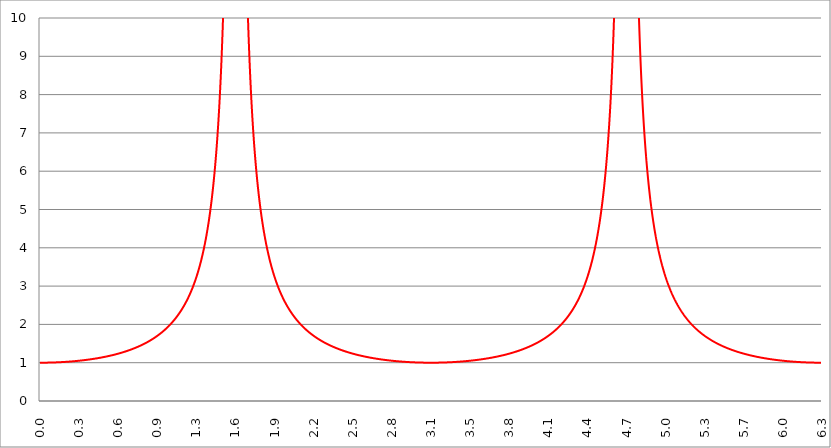
| Category | Series 1 | Series 0 | Series 2 |
|---|---|---|---|
| 0.0 | 1 |  |  |
| 0.00314159265358979 | 1 |  |  |
| 0.00628318530717958 | 1 |  |  |
| 0.00942477796076938 | 1 |  |  |
| 0.0125663706143592 | 1 |  |  |
| 0.015707963267949 | 1 |  |  |
| 0.0188495559215388 | 1 |  |  |
| 0.0219911485751285 | 1 |  |  |
| 0.0251327412287183 | 1 |  |  |
| 0.0282743338823081 | 1 |  |  |
| 0.0314159265358979 | 1 |  |  |
| 0.0345575191894877 | 1.001 |  |  |
| 0.0376991118430775 | 1.001 |  |  |
| 0.0408407044966673 | 1.001 |  |  |
| 0.0439822971502571 | 1.001 |  |  |
| 0.0471238898038469 | 1.001 |  |  |
| 0.0502654824574367 | 1.001 |  |  |
| 0.0534070751110265 | 1.001 |  |  |
| 0.0565486677646163 | 1.002 |  |  |
| 0.059690260418206 | 1.002 |  |  |
| 0.0628318530717958 | 1.002 |  |  |
| 0.0659734457253856 | 1.002 |  |  |
| 0.0691150383789754 | 1.002 |  |  |
| 0.0722566310325652 | 1.003 |  |  |
| 0.075398223686155 | 1.003 |  |  |
| 0.0785398163397448 | 1.003 |  |  |
| 0.0816814089933346 | 1.003 |  |  |
| 0.0848230016469244 | 1.004 |  |  |
| 0.0879645943005142 | 1.004 |  |  |
| 0.091106186954104 | 1.004 |  |  |
| 0.0942477796076937 | 1.004 |  |  |
| 0.0973893722612835 | 1.005 |  |  |
| 0.100530964914873 | 1.005 |  |  |
| 0.103672557568463 | 1.005 |  |  |
| 0.106814150222053 | 1.006 |  |  |
| 0.109955742875643 | 1.006 |  |  |
| 0.113097335529233 | 1.006 |  |  |
| 0.116238928182822 | 1.007 |  |  |
| 0.119380520836412 | 1.007 |  |  |
| 0.122522113490002 | 1.008 |  |  |
| 0.125663706143592 | 1.008 |  |  |
| 0.128805298797181 | 1.008 |  |  |
| 0.131946891450771 | 1.009 |  |  |
| 0.135088484104361 | 1.009 |  |  |
| 0.138230076757951 | 1.01 |  |  |
| 0.141371669411541 | 1.01 |  |  |
| 0.14451326206513 | 1.011 |  |  |
| 0.14765485471872 | 1.011 |  |  |
| 0.15079644737231 | 1.011 |  |  |
| 0.1539380400259 | 1.012 |  |  |
| 0.15707963267949 | 1.012 |  |  |
| 0.160221225333079 | 1.013 |  |  |
| 0.163362817986669 | 1.013 |  |  |
| 0.166504410640259 | 1.014 |  |  |
| 0.169646003293849 | 1.015 |  |  |
| 0.172787595947439 | 1.015 |  |  |
| 0.175929188601028 | 1.016 |  |  |
| 0.179070781254618 | 1.016 |  |  |
| 0.182212373908208 | 1.017 |  |  |
| 0.185353966561798 | 1.017 |  |  |
| 0.188495559215388 | 1.018 |  |  |
| 0.191637151868977 | 1.019 |  |  |
| 0.194778744522567 | 1.019 |  |  |
| 0.197920337176157 | 1.02 |  |  |
| 0.201061929829747 | 1.021 |  |  |
| 0.204203522483336 | 1.021 |  |  |
| 0.207345115136926 | 1.022 |  |  |
| 0.210486707790516 | 1.023 |  |  |
| 0.213628300444106 | 1.023 |  |  |
| 0.216769893097696 | 1.024 |  |  |
| 0.219911485751285 | 1.025 |  |  |
| 0.223053078404875 | 1.025 |  |  |
| 0.226194671058465 | 1.026 |  |  |
| 0.229336263712055 | 1.027 |  |  |
| 0.232477856365645 | 1.028 |  |  |
| 0.235619449019234 | 1.028 |  |  |
| 0.238761041672824 | 1.029 |  |  |
| 0.241902634326414 | 1.03 |  |  |
| 0.245044226980004 | 1.031 |  |  |
| 0.248185819633594 | 1.032 |  |  |
| 0.251327412287183 | 1.032 |  |  |
| 0.254469004940773 | 1.033 |  |  |
| 0.257610597594363 | 1.034 |  |  |
| 0.260752190247953 | 1.035 |  |  |
| 0.263893782901543 | 1.036 |  |  |
| 0.267035375555132 | 1.037 |  |  |
| 0.270176968208722 | 1.038 |  |  |
| 0.273318560862312 | 1.039 |  |  |
| 0.276460153515902 | 1.039 |  |  |
| 0.279601746169492 | 1.04 |  |  |
| 0.282743338823082 | 1.041 |  |  |
| 0.285884931476671 | 1.042 |  |  |
| 0.289026524130261 | 1.043 |  |  |
| 0.292168116783851 | 1.044 |  |  |
| 0.295309709437441 | 1.045 |  |  |
| 0.298451302091031 | 1.046 |  |  |
| 0.30159289474462 | 1.047 |  |  |
| 0.30473448739821 | 1.048 |  |  |
| 0.3078760800518 | 1.049 |  |  |
| 0.31101767270539 | 1.05 |  |  |
| 0.31415926535898 | 1.051 |  |  |
| 0.31730085801257 | 1.053 |  |  |
| 0.320442450666159 | 1.054 |  |  |
| 0.323584043319749 | 1.055 |  |  |
| 0.326725635973339 | 1.056 |  |  |
| 0.329867228626929 | 1.057 |  |  |
| 0.333008821280519 | 1.058 |  |  |
| 0.336150413934108 | 1.059 |  |  |
| 0.339292006587698 | 1.06 |  |  |
| 0.342433599241288 | 1.062 |  |  |
| 0.345575191894878 | 1.063 |  |  |
| 0.348716784548468 | 1.064 |  |  |
| 0.351858377202058 | 1.065 |  |  |
| 0.354999969855647 | 1.067 |  |  |
| 0.358141562509237 | 1.068 |  |  |
| 0.361283155162827 | 1.069 |  |  |
| 0.364424747816417 | 1.07 |  |  |
| 0.367566340470007 | 1.072 |  |  |
| 0.370707933123597 | 1.073 |  |  |
| 0.373849525777186 | 1.074 |  |  |
| 0.376991118430776 | 1.076 |  |  |
| 0.380132711084366 | 1.077 |  |  |
| 0.383274303737956 | 1.078 |  |  |
| 0.386415896391546 | 1.08 |  |  |
| 0.389557489045135 | 1.081 |  |  |
| 0.392699081698725 | 1.082 |  |  |
| 0.395840674352315 | 1.084 |  |  |
| 0.398982267005905 | 1.085 |  |  |
| 0.402123859659495 | 1.087 |  |  |
| 0.405265452313085 | 1.088 |  |  |
| 0.408407044966674 | 1.09 |  |  |
| 0.411548637620264 | 1.091 |  |  |
| 0.414690230273854 | 1.093 |  |  |
| 0.417831822927444 | 1.094 |  |  |
| 0.420973415581034 | 1.096 |  |  |
| 0.424115008234623 | 1.097 |  |  |
| 0.427256600888213 | 1.099 |  |  |
| 0.430398193541803 | 1.1 |  |  |
| 0.433539786195393 | 1.102 |  |  |
| 0.436681378848983 | 1.104 |  |  |
| 0.439822971502573 | 1.105 |  |  |
| 0.442964564156162 | 1.107 |  |  |
| 0.446106156809752 | 1.108 |  |  |
| 0.449247749463342 | 1.11 |  |  |
| 0.452389342116932 | 1.112 |  |  |
| 0.455530934770522 | 1.114 |  |  |
| 0.458672527424111 | 1.115 |  |  |
| 0.461814120077701 | 1.117 |  |  |
| 0.464955712731291 | 1.119 |  |  |
| 0.468097305384881 | 1.121 |  |  |
| 0.471238898038471 | 1.122 |  |  |
| 0.474380490692061 | 1.124 |  |  |
| 0.47752208334565 | 1.126 |  |  |
| 0.48066367599924 | 1.128 |  |  |
| 0.48380526865283 | 1.13 |  |  |
| 0.48694686130642 | 1.132 |  |  |
| 0.49008845396001 | 1.133 |  |  |
| 0.493230046613599 | 1.135 |  |  |
| 0.496371639267189 | 1.137 |  |  |
| 0.499513231920779 | 1.139 |  |  |
| 0.502654824574369 | 1.141 |  |  |
| 0.505796417227959 | 1.143 |  |  |
| 0.508938009881549 | 1.145 |  |  |
| 0.512079602535138 | 1.147 |  |  |
| 0.515221195188728 | 1.149 |  |  |
| 0.518362787842318 | 1.151 |  |  |
| 0.521504380495908 | 1.153 |  |  |
| 0.524645973149498 | 1.155 |  |  |
| 0.527787565803087 | 1.158 |  |  |
| 0.530929158456677 | 1.16 |  |  |
| 0.534070751110267 | 1.162 |  |  |
| 0.537212343763857 | 1.164 |  |  |
| 0.540353936417447 | 1.166 |  |  |
| 0.543495529071037 | 1.168 |  |  |
| 0.546637121724626 | 1.171 |  |  |
| 0.549778714378216 | 1.173 |  |  |
| 0.552920307031806 | 1.175 |  |  |
| 0.556061899685396 | 1.177 |  |  |
| 0.559203492338986 | 1.18 |  |  |
| 0.562345084992576 | 1.182 |  |  |
| 0.565486677646165 | 1.184 |  |  |
| 0.568628270299755 | 1.187 |  |  |
| 0.571769862953345 | 1.189 |  |  |
| 0.574911455606935 | 1.192 |  |  |
| 0.578053048260525 | 1.194 |  |  |
| 0.581194640914114 | 1.196 |  |  |
| 0.584336233567704 | 1.199 |  |  |
| 0.587477826221294 | 1.201 |  |  |
| 0.590619418874884 | 1.204 |  |  |
| 0.593761011528474 | 1.207 |  |  |
| 0.596902604182064 | 1.209 |  |  |
| 0.600044196835653 | 1.212 |  |  |
| 0.603185789489243 | 1.214 |  |  |
| 0.606327382142833 | 1.217 |  |  |
| 0.609468974796423 | 1.22 |  |  |
| 0.612610567450013 | 1.222 |  |  |
| 0.615752160103602 | 1.225 |  |  |
| 0.618893752757192 | 1.228 |  |  |
| 0.622035345410782 | 1.23 |  |  |
| 0.625176938064372 | 1.233 |  |  |
| 0.628318530717962 | 1.236 |  |  |
| 0.631460123371551 | 1.239 |  |  |
| 0.634601716025141 | 1.242 |  |  |
| 0.637743308678731 | 1.245 |  |  |
| 0.640884901332321 | 1.248 |  |  |
| 0.644026493985911 | 1.25 |  |  |
| 0.647168086639501 | 1.253 |  |  |
| 0.65030967929309 | 1.256 |  |  |
| 0.65345127194668 | 1.259 |  |  |
| 0.65659286460027 | 1.263 |  |  |
| 0.65973445725386 | 1.266 |  |  |
| 0.66287604990745 | 1.269 |  |  |
| 0.666017642561039 | 1.272 |  |  |
| 0.669159235214629 | 1.275 |  |  |
| 0.672300827868219 | 1.278 |  |  |
| 0.675442420521809 | 1.281 |  |  |
| 0.678584013175399 | 1.285 |  |  |
| 0.681725605828989 | 1.288 |  |  |
| 0.684867198482578 | 1.291 |  |  |
| 0.688008791136168 | 1.294 |  |  |
| 0.691150383789758 | 1.298 |  |  |
| 0.694291976443348 | 1.301 |  |  |
| 0.697433569096938 | 1.305 |  |  |
| 0.700575161750528 | 1.308 |  |  |
| 0.703716754404117 | 1.312 |  |  |
| 0.706858347057707 | 1.315 |  |  |
| 0.709999939711297 | 1.319 |  |  |
| 0.713141532364887 | 1.322 |  |  |
| 0.716283125018477 | 1.326 |  |  |
| 0.719424717672066 | 1.329 |  |  |
| 0.722566310325656 | 1.333 |  |  |
| 0.725707902979246 | 1.337 |  |  |
| 0.728849495632836 | 1.341 |  |  |
| 0.731991088286426 | 1.344 |  |  |
| 0.735132680940016 | 1.348 |  |  |
| 0.738274273593605 | 1.352 |  |  |
| 0.741415866247195 | 1.356 |  |  |
| 0.744557458900785 | 1.36 |  |  |
| 0.747699051554375 | 1.364 |  |  |
| 0.750840644207965 | 1.368 |  |  |
| 0.753982236861554 | 1.372 |  |  |
| 0.757123829515144 | 1.376 |  |  |
| 0.760265422168734 | 1.38 |  |  |
| 0.763407014822324 | 1.384 |  |  |
| 0.766548607475914 | 1.388 |  |  |
| 0.769690200129504 | 1.393 |  |  |
| 0.772831792783093 | 1.397 |  |  |
| 0.775973385436683 | 1.401 |  |  |
| 0.779114978090273 | 1.405 |  |  |
| 0.782256570743863 | 1.41 |  |  |
| 0.785398163397453 | 1.414 |  |  |
| 0.788539756051042 | 1.419 |  |  |
| 0.791681348704632 | 1.423 |  |  |
| 0.794822941358222 | 1.428 |  |  |
| 0.797964534011812 | 1.432 |  |  |
| 0.801106126665402 | 1.437 |  |  |
| 0.804247719318992 | 1.442 |  |  |
| 0.807389311972581 | 1.446 |  |  |
| 0.810530904626171 | 1.451 |  |  |
| 0.813672497279761 | 1.456 |  |  |
| 0.816814089933351 | 1.461 |  |  |
| 0.819955682586941 | 1.466 |  |  |
| 0.823097275240531 | 1.471 |  |  |
| 0.82623886789412 | 1.476 |  |  |
| 0.82938046054771 | 1.481 |  |  |
| 0.8325220532013 | 1.486 |  |  |
| 0.83566364585489 | 1.491 |  |  |
| 0.83880523850848 | 1.496 |  |  |
| 0.841946831162069 | 1.501 |  |  |
| 0.845088423815659 | 1.507 |  |  |
| 0.848230016469249 | 1.512 |  |  |
| 0.851371609122839 | 1.518 |  |  |
| 0.854513201776429 | 1.523 |  |  |
| 0.857654794430019 | 1.529 |  |  |
| 0.860796387083608 | 1.534 |  |  |
| 0.863937979737198 | 1.54 |  |  |
| 0.867079572390788 | 1.545 |  |  |
| 0.870221165044378 | 1.551 |  |  |
| 0.873362757697968 | 1.557 |  |  |
| 0.876504350351557 | 1.563 |  |  |
| 0.879645943005147 | 1.569 |  |  |
| 0.882787535658737 | 1.575 |  |  |
| 0.885929128312327 | 1.581 |  |  |
| 0.889070720965917 | 1.587 |  |  |
| 0.892212313619507 | 1.593 |  |  |
| 0.895353906273096 | 1.599 |  |  |
| 0.898495498926686 | 1.606 |  |  |
| 0.901637091580276 | 1.612 |  |  |
| 0.904778684233866 | 1.618 |  |  |
| 0.907920276887456 | 1.625 |  |  |
| 0.911061869541045 | 1.632 |  |  |
| 0.914203462194635 | 1.638 |  |  |
| 0.917345054848225 | 1.645 |  |  |
| 0.920486647501815 | 1.652 |  |  |
| 0.923628240155405 | 1.659 |  |  |
| 0.926769832808995 | 1.666 |  |  |
| 0.929911425462584 | 1.673 |  |  |
| 0.933053018116174 | 1.68 |  |  |
| 0.936194610769764 | 1.687 |  |  |
| 0.939336203423354 | 1.694 |  |  |
| 0.942477796076944 | 1.701 |  |  |
| 0.945619388730533 | 1.709 |  |  |
| 0.948760981384123 | 1.716 |  |  |
| 0.951902574037713 | 1.724 |  |  |
| 0.955044166691303 | 1.731 |  |  |
| 0.958185759344893 | 1.739 |  |  |
| 0.961327351998483 | 1.747 |  |  |
| 0.964468944652072 | 1.755 |  |  |
| 0.967610537305662 | 1.763 |  |  |
| 0.970752129959252 | 1.771 |  |  |
| 0.973893722612842 | 1.779 |  |  |
| 0.977035315266432 | 1.787 |  |  |
| 0.980176907920022 | 1.796 |  |  |
| 0.983318500573611 | 1.804 |  |  |
| 0.986460093227201 | 1.813 |  |  |
| 0.989601685880791 | 1.821 |  |  |
| 0.992743278534381 | 1.83 |  |  |
| 0.995884871187971 | 1.839 |  |  |
| 0.99902646384156 | 1.848 |  |  |
| 1.00216805649515 | 1.857 |  |  |
| 1.00530964914874 | 1.866 |  |  |
| 1.00845124180233 | 1.876 |  |  |
| 1.01159283445592 | 1.885 |  |  |
| 1.01473442710951 | 1.894 |  |  |
| 1.017876019763099 | 1.904 |  |  |
| 1.021017612416689 | 1.914 |  |  |
| 1.02415920507028 | 1.924 |  |  |
| 1.027300797723869 | 1.934 |  |  |
| 1.030442390377459 | 1.944 |  |  |
| 1.033583983031048 | 1.954 |  |  |
| 1.036725575684638 | 1.964 |  |  |
| 1.039867168338228 | 1.975 |  |  |
| 1.043008760991818 | 1.986 |  |  |
| 1.046150353645408 | 1.996 |  |  |
| 1.049291946298998 | 2.007 |  |  |
| 1.052433538952587 | 2.018 |  |  |
| 1.055575131606177 | 2.03 |  |  |
| 1.058716724259767 | 2.041 |  |  |
| 1.061858316913357 | 2.052 |  |  |
| 1.064999909566947 | 2.064 |  |  |
| 1.068141502220536 | 2.076 |  |  |
| 1.071283094874126 | 2.088 |  |  |
| 1.074424687527716 | 2.1 |  |  |
| 1.077566280181306 | 2.112 |  |  |
| 1.080707872834896 | 2.124 |  |  |
| 1.083849465488486 | 2.137 |  |  |
| 1.086991058142075 | 2.15 |  |  |
| 1.090132650795665 | 2.163 |  |  |
| 1.093274243449255 | 2.176 |  |  |
| 1.096415836102845 | 2.189 |  |  |
| 1.099557428756435 | 2.203 |  |  |
| 1.102699021410025 | 2.216 |  |  |
| 1.105840614063614 | 2.23 |  |  |
| 1.108982206717204 | 2.244 |  |  |
| 1.112123799370794 | 2.259 |  |  |
| 1.115265392024384 | 2.273 |  |  |
| 1.118406984677974 | 2.288 |  |  |
| 1.121548577331563 | 2.303 |  |  |
| 1.124690169985153 | 2.318 |  |  |
| 1.127831762638743 | 2.333 |  |  |
| 1.130973355292333 | 2.349 |  |  |
| 1.134114947945923 | 2.364 |  |  |
| 1.137256540599513 | 2.38 |  |  |
| 1.140398133253102 | 2.397 |  |  |
| 1.143539725906692 | 2.413 |  |  |
| 1.146681318560282 | 2.43 |  |  |
| 1.149822911213872 | 2.447 |  |  |
| 1.152964503867462 | 2.464 |  |  |
| 1.156106096521051 | 2.482 |  |  |
| 1.159247689174641 | 2.5 |  |  |
| 1.162389281828231 | 2.518 |  |  |
| 1.165530874481821 | 2.536 |  |  |
| 1.168672467135411 | 2.555 |  |  |
| 1.171814059789001 | 2.574 |  |  |
| 1.17495565244259 | 2.593 |  |  |
| 1.17809724509618 | 2.613 |  |  |
| 1.18123883774977 | 2.633 |  |  |
| 1.18438043040336 | 2.653 |  |  |
| 1.18752202305695 | 2.674 |  |  |
| 1.190663615710539 | 2.695 |  |  |
| 1.193805208364129 | 2.716 |  |  |
| 1.19694680101772 | 2.738 |  |  |
| 1.200088393671309 | 2.76 |  |  |
| 1.203229986324899 | 2.783 |  |  |
| 1.206371578978489 | 2.806 |  |  |
| 1.209513171632078 | 2.829 |  |  |
| 1.212654764285668 | 2.853 |  |  |
| 1.215796356939258 | 2.877 |  |  |
| 1.218937949592848 | 2.902 |  |  |
| 1.222079542246438 | 2.927 |  |  |
| 1.225221134900027 | 2.952 |  |  |
| 1.228362727553617 | 2.978 |  |  |
| 1.231504320207207 | 3.005 |  |  |
| 1.234645912860797 | 3.032 |  |  |
| 1.237787505514387 | 3.059 |  |  |
| 1.240929098167977 | 3.087 |  |  |
| 1.244070690821566 | 3.116 |  |  |
| 1.247212283475156 | 3.145 |  |  |
| 1.250353876128746 | 3.175 |  |  |
| 1.253495468782336 | 3.205 |  |  |
| 1.256637061435926 | 3.236 |  |  |
| 1.259778654089515 | 3.268 |  |  |
| 1.262920246743105 | 3.3 |  |  |
| 1.266061839396695 | 3.333 |  |  |
| 1.269203432050285 | 3.367 |  |  |
| 1.272345024703875 | 3.401 |  |  |
| 1.275486617357465 | 3.436 |  |  |
| 1.278628210011054 | 3.472 |  |  |
| 1.281769802664644 | 3.509 |  |  |
| 1.284911395318234 | 3.546 |  |  |
| 1.288052987971824 | 3.584 |  |  |
| 1.291194580625414 | 3.624 |  |  |
| 1.294336173279003 | 3.664 |  |  |
| 1.297477765932593 | 3.705 |  |  |
| 1.300619358586183 | 3.747 |  |  |
| 1.303760951239773 | 3.79 |  |  |
| 1.306902543893363 | 3.834 |  |  |
| 1.310044136546953 | 3.879 |  |  |
| 1.313185729200542 | 3.925 |  |  |
| 1.316327321854132 | 3.972 |  |  |
| 1.319468914507722 | 4.021 |  |  |
| 1.322610507161312 | 4.071 |  |  |
| 1.325752099814902 | 4.122 |  |  |
| 1.328893692468491 | 4.174 |  |  |
| 1.332035285122081 | 4.228 |  |  |
| 1.335176877775671 | 4.284 |  |  |
| 1.338318470429261 | 4.34 |  |  |
| 1.341460063082851 | 4.399 |  |  |
| 1.344601655736441 | 4.459 |  |  |
| 1.34774324839003 | 4.521 |  |  |
| 1.35088484104362 | 4.584 |  |  |
| 1.35402643369721 | 4.65 |  |  |
| 1.3571680263508 | 4.717 |  |  |
| 1.36030961900439 | 4.786 |  |  |
| 1.363451211657979 | 4.858 |  |  |
| 1.36659280431157 | 4.931 |  |  |
| 1.369734396965159 | 5.007 |  |  |
| 1.372875989618749 | 5.086 |  |  |
| 1.376017582272339 | 5.167 |  |  |
| 1.379159174925929 | 5.25 |  |  |
| 1.382300767579518 | 5.337 |  |  |
| 1.385442360233108 | 5.426 |  |  |
| 1.388583952886698 | 5.519 |  |  |
| 1.391725545540288 | 5.614 |  |  |
| 1.394867138193878 | 5.714 |  |  |
| 1.398008730847468 | 5.816 |  |  |
| 1.401150323501057 | 5.923 |  |  |
| 1.404291916154647 | 6.034 |  |  |
| 1.407433508808237 | 6.149 |  |  |
| 1.410575101461827 | 6.268 |  |  |
| 1.413716694115417 | 6.392 |  |  |
| 1.416858286769006 | 6.522 |  |  |
| 1.419999879422596 | 6.657 |  |  |
| 1.423141472076186 | 6.797 |  |  |
| 1.426283064729776 | 6.944 |  |  |
| 1.429424657383366 | 7.097 |  |  |
| 1.432566250036956 | 7.257 |  |  |
| 1.435707842690545 | 7.425 |  |  |
| 1.438849435344135 | 7.601 |  |  |
| 1.441991027997725 | 7.785 |  |  |
| 1.445132620651315 | 7.979 |  |  |
| 1.448274213304905 | 8.182 |  |  |
| 1.451415805958494 | 8.397 |  |  |
| 1.454557398612084 | 8.622 |  |  |
| 1.457698991265674 | 8.861 |  |  |
| 1.460840583919264 | 9.113 |  |  |
| 1.463982176572854 | 9.38 |  |  |
| 1.467123769226444 | 9.663 |  |  |
| 1.470265361880033 | 9.964 |  |  |
| 1.473406954533623 | 10.284 |  |  |
| 1.476548547187213 | 10.626 |  |  |
| 1.479690139840803 | 10.991 |  |  |
| 1.482831732494393 | 11.383 |  |  |
| 1.485973325147982 | 11.803 |  |  |
| 1.489114917801572 | 12.256 |  |  |
| 1.492256510455162 | 12.745 |  |  |
| 1.495398103108752 | 13.275 |  |  |
| 1.498539695762342 | 13.852 |  |  |
| 1.501681288415932 | 14.48 |  |  |
| 1.504822881069521 | 15.169 |  |  |
| 1.507964473723111 | 15.926 |  |  |
| 1.511106066376701 | 16.763 |  |  |
| 1.514247659030291 | 17.693 |  |  |
| 1.517389251683881 | 18.733 |  |  |
| 1.520530844337471 | 19.903 |  |  |
| 1.52367243699106 | 21.229 |  |  |
| 1.52681402964465 | 22.744 |  |  |
| 1.52995562229824 | 24.492 |  |  |
| 1.53309721495183 | 26.532 |  |  |
| 1.53623880760542 | 28.943 |  |  |
| 1.539380400259009 | 31.836 |  |  |
| 1.542521992912599 | 35.372 |  |  |
| 1.545663585566189 | 39.793 |  |  |
| 1.548805178219779 | 45.477 |  |  |
| 1.551946770873369 | 53.055 |  |  |
| 1.555088363526959 | 63.665 |  |  |
| 1.558229956180548 | 79.58 |  |  |
| 1.561371548834138 | 106.105 |  |  |
| 1.564513141487728 | 159.156 |  |  |
| 1.567654734141318 | 318.31 |  |  |
| 1.570796326794908 | 90571729138849.9 |  |  |
| 1.573937919448497 | 318.31 |  |  |
| 1.577079512102087 | 159.156 |  |  |
| 1.580221104755677 | 106.105 |  |  |
| 1.583362697409267 | 79.58 |  |  |
| 1.586504290062857 | 63.665 |  |  |
| 1.589645882716447 | 53.055 |  |  |
| 1.592787475370036 | 45.477 |  |  |
| 1.595929068023626 | 39.793 |  |  |
| 1.599070660677216 | 35.372 |  |  |
| 1.602212253330806 | 31.836 |  |  |
| 1.605353845984396 | 28.943 |  |  |
| 1.608495438637985 | 26.532 |  |  |
| 1.611637031291575 | 24.492 |  |  |
| 1.614778623945165 | 22.744 |  |  |
| 1.617920216598755 | 21.229 |  |  |
| 1.621061809252345 | 19.903 |  |  |
| 1.624203401905935 | 18.733 |  |  |
| 1.627344994559524 | 17.693 |  |  |
| 1.630486587213114 | 16.763 |  |  |
| 1.633628179866704 | 15.926 |  |  |
| 1.636769772520294 | 15.169 |  |  |
| 1.639911365173884 | 14.48 |  |  |
| 1.643052957827473 | 13.852 |  |  |
| 1.646194550481063 | 13.275 |  |  |
| 1.649336143134653 | 12.745 |  |  |
| 1.652477735788243 | 12.256 |  |  |
| 1.655619328441833 | 11.803 |  |  |
| 1.658760921095423 | 11.383 |  |  |
| 1.661902513749012 | 10.991 |  |  |
| 1.665044106402602 | 10.626 |  |  |
| 1.668185699056192 | 10.284 |  |  |
| 1.671327291709782 | 9.964 |  |  |
| 1.674468884363372 | 9.663 |  |  |
| 1.677610477016961 | 9.38 |  |  |
| 1.680752069670551 | 9.113 |  |  |
| 1.683893662324141 | 8.861 |  |  |
| 1.687035254977731 | 8.622 |  |  |
| 1.690176847631321 | 8.397 |  |  |
| 1.693318440284911 | 8.182 |  |  |
| 1.6964600329385 | 7.979 |  |  |
| 1.69960162559209 | 7.785 |  |  |
| 1.70274321824568 | 7.601 |  |  |
| 1.70588481089927 | 7.425 |  |  |
| 1.70902640355286 | 7.257 |  |  |
| 1.712167996206449 | 7.097 |  |  |
| 1.715309588860039 | 6.944 |  |  |
| 1.71845118151363 | 6.797 |  |  |
| 1.721592774167219 | 6.657 |  |  |
| 1.724734366820809 | 6.522 |  |  |
| 1.727875959474399 | 6.392 |  |  |
| 1.731017552127988 | 6.268 |  |  |
| 1.734159144781578 | 6.149 |  |  |
| 1.737300737435168 | 6.034 |  |  |
| 1.740442330088758 | 5.923 |  |  |
| 1.743583922742348 | 5.816 |  |  |
| 1.746725515395937 | 5.714 |  |  |
| 1.749867108049527 | 5.614 |  |  |
| 1.753008700703117 | 5.519 |  |  |
| 1.756150293356707 | 5.426 |  |  |
| 1.759291886010297 | 5.337 |  |  |
| 1.762433478663887 | 5.25 |  |  |
| 1.765575071317476 | 5.167 |  |  |
| 1.768716663971066 | 5.086 |  |  |
| 1.771858256624656 | 5.007 |  |  |
| 1.774999849278246 | 4.931 |  |  |
| 1.778141441931836 | 4.858 |  |  |
| 1.781283034585426 | 4.786 |  |  |
| 1.784424627239015 | 4.717 |  |  |
| 1.787566219892605 | 4.65 |  |  |
| 1.790707812546195 | 4.584 |  |  |
| 1.793849405199785 | 4.521 |  |  |
| 1.796990997853375 | 4.459 |  |  |
| 1.800132590506964 | 4.399 |  |  |
| 1.803274183160554 | 4.34 |  |  |
| 1.806415775814144 | 4.284 |  |  |
| 1.809557368467734 | 4.228 |  |  |
| 1.812698961121324 | 4.174 |  |  |
| 1.815840553774914 | 4.122 |  |  |
| 1.818982146428503 | 4.071 |  |  |
| 1.822123739082093 | 4.021 |  |  |
| 1.825265331735683 | 3.972 |  |  |
| 1.828406924389273 | 3.925 |  |  |
| 1.831548517042863 | 3.879 |  |  |
| 1.834690109696452 | 3.834 |  |  |
| 1.837831702350042 | 3.79 |  |  |
| 1.840973295003632 | 3.747 |  |  |
| 1.844114887657222 | 3.705 |  |  |
| 1.847256480310812 | 3.664 |  |  |
| 1.850398072964402 | 3.624 |  |  |
| 1.853539665617991 | 3.584 |  |  |
| 1.856681258271581 | 3.546 |  |  |
| 1.859822850925171 | 3.509 |  |  |
| 1.862964443578761 | 3.472 |  |  |
| 1.866106036232351 | 3.436 |  |  |
| 1.86924762888594 | 3.401 |  |  |
| 1.87238922153953 | 3.367 |  |  |
| 1.87553081419312 | 3.333 |  |  |
| 1.87867240684671 | 3.3 |  |  |
| 1.8818139995003 | 3.268 |  |  |
| 1.88495559215389 | 3.236 |  |  |
| 1.888097184807479 | 3.205 |  |  |
| 1.891238777461069 | 3.175 |  |  |
| 1.89438037011466 | 3.145 |  |  |
| 1.897521962768249 | 3.116 |  |  |
| 1.900663555421839 | 3.087 |  |  |
| 1.903805148075429 | 3.059 |  |  |
| 1.906946740729018 | 3.032 |  |  |
| 1.910088333382608 | 3.005 |  |  |
| 1.913229926036198 | 2.978 |  |  |
| 1.916371518689788 | 2.952 |  |  |
| 1.919513111343378 | 2.927 |  |  |
| 1.922654703996967 | 2.902 |  |  |
| 1.925796296650557 | 2.877 |  |  |
| 1.928937889304147 | 2.853 |  |  |
| 1.932079481957737 | 2.829 |  |  |
| 1.935221074611327 | 2.806 |  |  |
| 1.938362667264917 | 2.783 |  |  |
| 1.941504259918506 | 2.76 |  |  |
| 1.944645852572096 | 2.738 |  |  |
| 1.947787445225686 | 2.716 |  |  |
| 1.950929037879276 | 2.695 |  |  |
| 1.954070630532866 | 2.674 |  |  |
| 1.957212223186455 | 2.653 |  |  |
| 1.960353815840045 | 2.633 |  |  |
| 1.963495408493635 | 2.613 |  |  |
| 1.966637001147225 | 2.593 |  |  |
| 1.969778593800815 | 2.574 |  |  |
| 1.972920186454405 | 2.555 |  |  |
| 1.976061779107994 | 2.536 |  |  |
| 1.979203371761584 | 2.518 |  |  |
| 1.982344964415174 | 2.5 |  |  |
| 1.985486557068764 | 2.482 |  |  |
| 1.988628149722354 | 2.464 |  |  |
| 1.991769742375943 | 2.447 |  |  |
| 1.994911335029533 | 2.43 |  |  |
| 1.998052927683123 | 2.413 |  |  |
| 2.001194520336712 | 2.397 |  |  |
| 2.004336112990302 | 2.38 |  |  |
| 2.007477705643892 | 2.364 |  |  |
| 2.010619298297482 | 2.349 |  |  |
| 2.013760890951071 | 2.333 |  |  |
| 2.016902483604661 | 2.318 |  |  |
| 2.02004407625825 | 2.303 |  |  |
| 2.02318566891184 | 2.288 |  |  |
| 2.02632726156543 | 2.273 |  |  |
| 2.029468854219019 | 2.259 |  |  |
| 2.032610446872609 | 2.244 |  |  |
| 2.035752039526198 | 2.23 |  |  |
| 2.038893632179788 | 2.216 |  |  |
| 2.042035224833378 | 2.203 |  |  |
| 2.045176817486967 | 2.189 |  |  |
| 2.048318410140557 | 2.176 |  |  |
| 2.051460002794146 | 2.163 |  |  |
| 2.054601595447736 | 2.15 |  |  |
| 2.057743188101325 | 2.137 |  |  |
| 2.060884780754915 | 2.124 |  |  |
| 2.064026373408505 | 2.112 |  |  |
| 2.067167966062094 | 2.1 |  |  |
| 2.070309558715684 | 2.088 |  |  |
| 2.073451151369273 | 2.076 |  |  |
| 2.076592744022863 | 2.064 |  |  |
| 2.079734336676452 | 2.052 |  |  |
| 2.082875929330042 | 2.041 |  |  |
| 2.086017521983632 | 2.03 |  |  |
| 2.089159114637221 | 2.018 |  |  |
| 2.092300707290811 | 2.007 |  |  |
| 2.095442299944401 | 1.996 |  |  |
| 2.09858389259799 | 1.986 |  |  |
| 2.10172548525158 | 1.975 |  |  |
| 2.104867077905169 | 1.964 |  |  |
| 2.108008670558759 | 1.954 |  |  |
| 2.111150263212349 | 1.944 |  |  |
| 2.114291855865938 | 1.934 |  |  |
| 2.117433448519528 | 1.924 |  |  |
| 2.120575041173117 | 1.914 |  |  |
| 2.123716633826707 | 1.904 |  |  |
| 2.126858226480297 | 1.894 |  |  |
| 2.129999819133886 | 1.885 |  |  |
| 2.133141411787476 | 1.876 |  |  |
| 2.136283004441065 | 1.866 |  |  |
| 2.139424597094655 | 1.857 |  |  |
| 2.142566189748245 | 1.848 |  |  |
| 2.145707782401834 | 1.839 |  |  |
| 2.148849375055424 | 1.83 |  |  |
| 2.151990967709013 | 1.821 |  |  |
| 2.155132560362603 | 1.813 |  |  |
| 2.158274153016193 | 1.804 |  |  |
| 2.161415745669782 | 1.796 |  |  |
| 2.164557338323372 | 1.787 |  |  |
| 2.167698930976961 | 1.779 |  |  |
| 2.170840523630551 | 1.771 |  |  |
| 2.173982116284141 | 1.763 |  |  |
| 2.17712370893773 | 1.755 |  |  |
| 2.18026530159132 | 1.747 |  |  |
| 2.183406894244909 | 1.739 |  |  |
| 2.186548486898499 | 1.731 |  |  |
| 2.189690079552089 | 1.724 |  |  |
| 2.192831672205678 | 1.716 |  |  |
| 2.195973264859268 | 1.709 |  |  |
| 2.199114857512857 | 1.701 |  |  |
| 2.202256450166447 | 1.694 |  |  |
| 2.205398042820036 | 1.687 |  |  |
| 2.208539635473626 | 1.68 |  |  |
| 2.211681228127216 | 1.673 |  |  |
| 2.214822820780805 | 1.666 |  |  |
| 2.217964413434395 | 1.659 |  |  |
| 2.221106006087984 | 1.652 |  |  |
| 2.224247598741574 | 1.645 |  |  |
| 2.227389191395164 | 1.638 |  |  |
| 2.230530784048753 | 1.632 |  |  |
| 2.233672376702343 | 1.625 |  |  |
| 2.236813969355933 | 1.618 |  |  |
| 2.239955562009522 | 1.612 |  |  |
| 2.243097154663112 | 1.606 |  |  |
| 2.246238747316701 | 1.599 |  |  |
| 2.249380339970291 | 1.593 |  |  |
| 2.252521932623881 | 1.587 |  |  |
| 2.25566352527747 | 1.581 |  |  |
| 2.25880511793106 | 1.575 |  |  |
| 2.261946710584649 | 1.569 |  |  |
| 2.265088303238239 | 1.563 |  |  |
| 2.268229895891829 | 1.557 |  |  |
| 2.271371488545418 | 1.551 |  |  |
| 2.274513081199008 | 1.545 |  |  |
| 2.277654673852597 | 1.54 |  |  |
| 2.280796266506186 | 1.534 |  |  |
| 2.283937859159776 | 1.529 |  |  |
| 2.287079451813366 | 1.523 |  |  |
| 2.290221044466955 | 1.518 |  |  |
| 2.293362637120545 | 1.512 |  |  |
| 2.296504229774135 | 1.507 |  |  |
| 2.299645822427724 | 1.501 |  |  |
| 2.302787415081314 | 1.496 |  |  |
| 2.305929007734904 | 1.491 |  |  |
| 2.309070600388493 | 1.486 |  |  |
| 2.312212193042083 | 1.481 |  |  |
| 2.315353785695672 | 1.476 |  |  |
| 2.318495378349262 | 1.471 |  |  |
| 2.321636971002852 | 1.466 |  |  |
| 2.324778563656441 | 1.461 |  |  |
| 2.327920156310031 | 1.456 |  |  |
| 2.33106174896362 | 1.451 |  |  |
| 2.33420334161721 | 1.446 |  |  |
| 2.3373449342708 | 1.442 |  |  |
| 2.340486526924389 | 1.437 |  |  |
| 2.343628119577979 | 1.432 |  |  |
| 2.346769712231568 | 1.428 |  |  |
| 2.349911304885158 | 1.423 |  |  |
| 2.353052897538748 | 1.419 |  |  |
| 2.356194490192337 | 1.414 |  |  |
| 2.359336082845927 | 1.41 |  |  |
| 2.362477675499516 | 1.405 |  |  |
| 2.365619268153106 | 1.401 |  |  |
| 2.368760860806696 | 1.397 |  |  |
| 2.371902453460285 | 1.393 |  |  |
| 2.375044046113875 | 1.388 |  |  |
| 2.378185638767464 | 1.384 |  |  |
| 2.381327231421054 | 1.38 |  |  |
| 2.384468824074644 | 1.376 |  |  |
| 2.387610416728233 | 1.372 |  |  |
| 2.390752009381823 | 1.368 |  |  |
| 2.393893602035412 | 1.364 |  |  |
| 2.397035194689002 | 1.36 |  |  |
| 2.400176787342591 | 1.356 |  |  |
| 2.403318379996181 | 1.352 |  |  |
| 2.406459972649771 | 1.348 |  |  |
| 2.40960156530336 | 1.344 |  |  |
| 2.41274315795695 | 1.341 |  |  |
| 2.41588475061054 | 1.337 |  |  |
| 2.419026343264129 | 1.333 |  |  |
| 2.422167935917719 | 1.329 |  |  |
| 2.425309528571308 | 1.326 |  |  |
| 2.428451121224898 | 1.322 |  |  |
| 2.431592713878488 | 1.319 |  |  |
| 2.434734306532077 | 1.315 |  |  |
| 2.437875899185667 | 1.312 |  |  |
| 2.441017491839256 | 1.308 |  |  |
| 2.444159084492846 | 1.305 |  |  |
| 2.447300677146435 | 1.301 |  |  |
| 2.450442269800025 | 1.298 |  |  |
| 2.453583862453615 | 1.294 |  |  |
| 2.456725455107204 | 1.291 |  |  |
| 2.459867047760794 | 1.288 |  |  |
| 2.463008640414384 | 1.285 |  |  |
| 2.466150233067973 | 1.281 |  |  |
| 2.469291825721563 | 1.278 |  |  |
| 2.472433418375152 | 1.275 |  |  |
| 2.475575011028742 | 1.272 |  |  |
| 2.478716603682332 | 1.269 |  |  |
| 2.481858196335921 | 1.266 |  |  |
| 2.48499978898951 | 1.263 |  |  |
| 2.4881413816431 | 1.259 |  |  |
| 2.49128297429669 | 1.256 |  |  |
| 2.49442456695028 | 1.253 |  |  |
| 2.497566159603869 | 1.25 |  |  |
| 2.500707752257458 | 1.248 |  |  |
| 2.503849344911048 | 1.245 |  |  |
| 2.506990937564638 | 1.242 |  |  |
| 2.510132530218228 | 1.239 |  |  |
| 2.513274122871817 | 1.236 |  |  |
| 2.516415715525407 | 1.233 |  |  |
| 2.519557308178996 | 1.23 |  |  |
| 2.522698900832586 | 1.228 |  |  |
| 2.525840493486176 | 1.225 |  |  |
| 2.528982086139765 | 1.222 |  |  |
| 2.532123678793355 | 1.22 |  |  |
| 2.535265271446944 | 1.217 |  |  |
| 2.538406864100534 | 1.214 |  |  |
| 2.541548456754124 | 1.212 |  |  |
| 2.544690049407713 | 1.209 |  |  |
| 2.547831642061302 | 1.207 |  |  |
| 2.550973234714892 | 1.204 |  |  |
| 2.554114827368482 | 1.201 |  |  |
| 2.557256420022072 | 1.199 |  |  |
| 2.560398012675661 | 1.196 |  |  |
| 2.563539605329251 | 1.194 |  |  |
| 2.56668119798284 | 1.192 |  |  |
| 2.56982279063643 | 1.189 |  |  |
| 2.57296438329002 | 1.187 |  |  |
| 2.576105975943609 | 1.184 |  |  |
| 2.579247568597199 | 1.182 |  |  |
| 2.582389161250788 | 1.18 |  |  |
| 2.585530753904377 | 1.177 |  |  |
| 2.588672346557967 | 1.175 |  |  |
| 2.591813939211557 | 1.173 |  |  |
| 2.594955531865147 | 1.171 |  |  |
| 2.598097124518736 | 1.168 |  |  |
| 2.601238717172326 | 1.166 |  |  |
| 2.604380309825915 | 1.164 |  |  |
| 2.607521902479505 | 1.162 |  |  |
| 2.610663495133095 | 1.16 |  |  |
| 2.613805087786684 | 1.158 |  |  |
| 2.616946680440274 | 1.155 |  |  |
| 2.620088273093863 | 1.153 |  |  |
| 2.623229865747452 | 1.151 |  |  |
| 2.626371458401042 | 1.149 |  |  |
| 2.629513051054632 | 1.147 |  |  |
| 2.632654643708222 | 1.145 |  |  |
| 2.635796236361811 | 1.143 |  |  |
| 2.638937829015401 | 1.141 |  |  |
| 2.642079421668991 | 1.139 |  |  |
| 2.64522101432258 | 1.137 |  |  |
| 2.64836260697617 | 1.135 |  |  |
| 2.651504199629759 | 1.133 |  |  |
| 2.654645792283349 | 1.132 |  |  |
| 2.657787384936938 | 1.13 |  |  |
| 2.660928977590528 | 1.128 |  |  |
| 2.664070570244118 | 1.126 |  |  |
| 2.667212162897707 | 1.124 |  |  |
| 2.670353755551297 | 1.122 |  |  |
| 2.673495348204887 | 1.121 |  |  |
| 2.676636940858476 | 1.119 |  |  |
| 2.679778533512066 | 1.117 |  |  |
| 2.682920126165655 | 1.115 |  |  |
| 2.686061718819245 | 1.114 |  |  |
| 2.689203311472835 | 1.112 |  |  |
| 2.692344904126424 | 1.11 |  |  |
| 2.695486496780014 | 1.108 |  |  |
| 2.698628089433603 | 1.107 |  |  |
| 2.701769682087193 | 1.105 |  |  |
| 2.704911274740782 | 1.104 |  |  |
| 2.708052867394372 | 1.102 |  |  |
| 2.711194460047962 | 1.1 |  |  |
| 2.714336052701551 | 1.099 |  |  |
| 2.717477645355141 | 1.097 |  |  |
| 2.720619238008731 | 1.096 |  |  |
| 2.72376083066232 | 1.094 |  |  |
| 2.72690242331591 | 1.093 |  |  |
| 2.730044015969499 | 1.091 |  |  |
| 2.733185608623089 | 1.09 |  |  |
| 2.736327201276678 | 1.088 |  |  |
| 2.739468793930268 | 1.087 |  |  |
| 2.742610386583858 | 1.085 |  |  |
| 2.745751979237447 | 1.084 |  |  |
| 2.748893571891036 | 1.082 |  |  |
| 2.752035164544627 | 1.081 |  |  |
| 2.755176757198216 | 1.08 |  |  |
| 2.758318349851806 | 1.078 |  |  |
| 2.761459942505395 | 1.077 |  |  |
| 2.764601535158985 | 1.076 |  |  |
| 2.767743127812574 | 1.074 |  |  |
| 2.770884720466164 | 1.073 |  |  |
| 2.774026313119754 | 1.072 |  |  |
| 2.777167905773343 | 1.07 |  |  |
| 2.780309498426932 | 1.069 |  |  |
| 2.783451091080522 | 1.068 |  |  |
| 2.786592683734112 | 1.067 |  |  |
| 2.789734276387701 | 1.065 |  |  |
| 2.792875869041291 | 1.064 |  |  |
| 2.796017461694881 | 1.063 |  |  |
| 2.79915905434847 | 1.062 |  |  |
| 2.80230064700206 | 1.06 |  |  |
| 2.80544223965565 | 1.059 |  |  |
| 2.808583832309239 | 1.058 |  |  |
| 2.811725424962829 | 1.057 |  |  |
| 2.814867017616419 | 1.056 |  |  |
| 2.818008610270008 | 1.055 |  |  |
| 2.821150202923598 | 1.054 |  |  |
| 2.824291795577187 | 1.053 |  |  |
| 2.827433388230777 | 1.051 |  |  |
| 2.830574980884366 | 1.05 |  |  |
| 2.833716573537956 | 1.049 |  |  |
| 2.836858166191546 | 1.048 |  |  |
| 2.839999758845135 | 1.047 |  |  |
| 2.843141351498725 | 1.046 |  |  |
| 2.846282944152314 | 1.045 |  |  |
| 2.849424536805904 | 1.044 |  |  |
| 2.852566129459494 | 1.043 |  |  |
| 2.855707722113083 | 1.042 |  |  |
| 2.858849314766673 | 1.041 |  |  |
| 2.861990907420262 | 1.04 |  |  |
| 2.865132500073852 | 1.039 |  |  |
| 2.868274092727442 | 1.039 |  |  |
| 2.871415685381031 | 1.038 |  |  |
| 2.874557278034621 | 1.037 |  |  |
| 2.87769887068821 | 1.036 |  |  |
| 2.8808404633418 | 1.035 |  |  |
| 2.88398205599539 | 1.034 |  |  |
| 2.88712364864898 | 1.033 |  |  |
| 2.890265241302569 | 1.032 |  |  |
| 2.893406833956158 | 1.032 |  |  |
| 2.896548426609748 | 1.031 |  |  |
| 2.899690019263338 | 1.03 |  |  |
| 2.902831611916927 | 1.029 |  |  |
| 2.905973204570517 | 1.028 |  |  |
| 2.909114797224106 | 1.028 |  |  |
| 2.912256389877696 | 1.027 |  |  |
| 2.915397982531286 | 1.026 |  |  |
| 2.918539575184875 | 1.025 |  |  |
| 2.921681167838465 | 1.025 |  |  |
| 2.924822760492054 | 1.024 |  |  |
| 2.927964353145644 | 1.023 |  |  |
| 2.931105945799234 | 1.023 |  |  |
| 2.934247538452823 | 1.022 |  |  |
| 2.937389131106413 | 1.021 |  |  |
| 2.940530723760002 | 1.021 |  |  |
| 2.943672316413592 | 1.02 |  |  |
| 2.946813909067182 | 1.019 |  |  |
| 2.949955501720771 | 1.019 |  |  |
| 2.953097094374361 | 1.018 |  |  |
| 2.95623868702795 | 1.017 |  |  |
| 2.95938027968154 | 1.017 |  |  |
| 2.96252187233513 | 1.016 |  |  |
| 2.965663464988719 | 1.016 |  |  |
| 2.968805057642309 | 1.015 |  |  |
| 2.971946650295898 | 1.015 |  |  |
| 2.975088242949488 | 1.014 |  |  |
| 2.978229835603078 | 1.013 |  |  |
| 2.981371428256667 | 1.013 |  |  |
| 2.984513020910257 | 1.012 |  |  |
| 2.987654613563846 | 1.012 |  |  |
| 2.990796206217436 | 1.011 |  |  |
| 2.993937798871025 | 1.011 |  |  |
| 2.997079391524615 | 1.011 |  |  |
| 3.000220984178205 | 1.01 |  |  |
| 3.003362576831794 | 1.01 |  |  |
| 3.006504169485384 | 1.009 |  |  |
| 3.009645762138974 | 1.009 |  |  |
| 3.012787354792563 | 1.008 |  |  |
| 3.015928947446153 | 1.008 |  |  |
| 3.019070540099742 | 1.008 |  |  |
| 3.022212132753332 | 1.007 |  |  |
| 3.025353725406922 | 1.007 |  |  |
| 3.028495318060511 | 1.006 |  |  |
| 3.031636910714101 | 1.006 |  |  |
| 3.03477850336769 | 1.006 |  |  |
| 3.03792009602128 | 1.005 |  |  |
| 3.04106168867487 | 1.005 |  |  |
| 3.04420328132846 | 1.005 |  |  |
| 3.047344873982049 | 1.004 |  |  |
| 3.050486466635638 | 1.004 |  |  |
| 3.053628059289228 | 1.004 |  |  |
| 3.056769651942818 | 1.004 |  |  |
| 3.059911244596407 | 1.003 |  |  |
| 3.063052837249997 | 1.003 |  |  |
| 3.066194429903586 | 1.003 |  |  |
| 3.069336022557176 | 1.003 |  |  |
| 3.072477615210766 | 1.002 |  |  |
| 3.075619207864355 | 1.002 |  |  |
| 3.078760800517945 | 1.002 |  |  |
| 3.081902393171534 | 1.002 |  |  |
| 3.085043985825124 | 1.002 |  |  |
| 3.088185578478713 | 1.001 |  |  |
| 3.091327171132303 | 1.001 |  |  |
| 3.094468763785893 | 1.001 |  |  |
| 3.097610356439482 | 1.001 |  |  |
| 3.100751949093072 | 1.001 |  |  |
| 3.103893541746661 | 1.001 |  |  |
| 3.107035134400251 | 1.001 |  |  |
| 3.110176727053841 | 1 |  |  |
| 3.11331831970743 | 1 |  |  |
| 3.11645991236102 | 1 |  |  |
| 3.11960150501461 | 1 |  |  |
| 3.122743097668199 | 1 |  |  |
| 3.125884690321789 | 1 |  |  |
| 3.129026282975378 | 1 |  |  |
| 3.132167875628968 | 1 |  |  |
| 3.135309468282557 | 1 |  |  |
| 3.138451060936147 | 1 |  |  |
| 3.141592653589737 | 1 |  |  |
| 3.144734246243326 | 1 |  |  |
| 3.147875838896916 | 1 |  |  |
| 3.151017431550505 | 1 |  |  |
| 3.154159024204095 | 1 |  |  |
| 3.157300616857685 | 1 |  |  |
| 3.160442209511274 | 1 |  |  |
| 3.163583802164864 | 1 |  |  |
| 3.166725394818453 | 1 |  |  |
| 3.169866987472043 | 1 |  |  |
| 3.173008580125633 | 1 |  |  |
| 3.176150172779222 | 1.001 |  |  |
| 3.179291765432812 | 1.001 |  |  |
| 3.182433358086401 | 1.001 |  |  |
| 3.185574950739991 | 1.001 |  |  |
| 3.188716543393581 | 1.001 |  |  |
| 3.19185813604717 | 1.001 |  |  |
| 3.19499972870076 | 1.001 |  |  |
| 3.198141321354349 | 1.002 |  |  |
| 3.20128291400794 | 1.002 |  |  |
| 3.204424506661528 | 1.002 |  |  |
| 3.207566099315118 | 1.002 |  |  |
| 3.210707691968708 | 1.002 |  |  |
| 3.213849284622297 | 1.003 |  |  |
| 3.216990877275887 | 1.003 |  |  |
| 3.220132469929476 | 1.003 |  |  |
| 3.223274062583066 | 1.003 |  |  |
| 3.226415655236656 | 1.004 |  |  |
| 3.229557247890245 | 1.004 |  |  |
| 3.232698840543835 | 1.004 |  |  |
| 3.235840433197425 | 1.004 |  |  |
| 3.238982025851014 | 1.005 |  |  |
| 3.242123618504604 | 1.005 |  |  |
| 3.245265211158193 | 1.005 |  |  |
| 3.248406803811783 | 1.006 |  |  |
| 3.251548396465373 | 1.006 |  |  |
| 3.254689989118962 | 1.006 |  |  |
| 3.257831581772551 | 1.007 |  |  |
| 3.260973174426141 | 1.007 |  |  |
| 3.26411476707973 | 1.008 |  |  |
| 3.267256359733321 | 1.008 |  |  |
| 3.27039795238691 | 1.008 |  |  |
| 3.2735395450405 | 1.009 |  |  |
| 3.276681137694089 | 1.009 |  |  |
| 3.279822730347679 | 1.01 |  |  |
| 3.282964323001269 | 1.01 |  |  |
| 3.286105915654858 | 1.011 |  |  |
| 3.289247508308448 | 1.011 |  |  |
| 3.292389100962037 | 1.011 |  |  |
| 3.295530693615627 | 1.012 |  |  |
| 3.298672286269217 | 1.012 |  |  |
| 3.301813878922806 | 1.013 |  |  |
| 3.304955471576396 | 1.013 |  |  |
| 3.308097064229985 | 1.014 |  |  |
| 3.311238656883575 | 1.015 |  |  |
| 3.314380249537165 | 1.015 |  |  |
| 3.317521842190754 | 1.016 |  |  |
| 3.320663434844344 | 1.016 |  |  |
| 3.323805027497933 | 1.017 |  |  |
| 3.326946620151523 | 1.017 |  |  |
| 3.330088212805113 | 1.018 |  |  |
| 3.333229805458702 | 1.019 |  |  |
| 3.336371398112292 | 1.019 |  |  |
| 3.339512990765881 | 1.02 |  |  |
| 3.342654583419471 | 1.021 |  |  |
| 3.345796176073061 | 1.021 |  |  |
| 3.34893776872665 | 1.022 |  |  |
| 3.35207936138024 | 1.023 |  |  |
| 3.355220954033829 | 1.023 |  |  |
| 3.358362546687419 | 1.024 |  |  |
| 3.361504139341009 | 1.025 |  |  |
| 3.364645731994598 | 1.025 |  |  |
| 3.367787324648188 | 1.026 |  |  |
| 3.370928917301777 | 1.027 |  |  |
| 3.374070509955367 | 1.028 |  |  |
| 3.377212102608956 | 1.028 |  |  |
| 3.380353695262546 | 1.029 |  |  |
| 3.383495287916136 | 1.03 |  |  |
| 3.386636880569725 | 1.031 |  |  |
| 3.389778473223315 | 1.032 |  |  |
| 3.392920065876904 | 1.032 |  |  |
| 3.396061658530494 | 1.033 |  |  |
| 3.399203251184084 | 1.034 |  |  |
| 3.402344843837673 | 1.035 |  |  |
| 3.405486436491263 | 1.036 |  |  |
| 3.408628029144852 | 1.037 |  |  |
| 3.411769621798442 | 1.038 |  |  |
| 3.414911214452032 | 1.039 |  |  |
| 3.418052807105621 | 1.039 |  |  |
| 3.421194399759211 | 1.04 |  |  |
| 3.4243359924128 | 1.041 |  |  |
| 3.42747758506639 | 1.042 |  |  |
| 3.43061917771998 | 1.043 |  |  |
| 3.433760770373569 | 1.044 |  |  |
| 3.436902363027159 | 1.045 |  |  |
| 3.440043955680748 | 1.046 |  |  |
| 3.443185548334338 | 1.047 |  |  |
| 3.446327140987927 | 1.048 |  |  |
| 3.449468733641517 | 1.049 |  |  |
| 3.452610326295107 | 1.05 |  |  |
| 3.455751918948696 | 1.051 |  |  |
| 3.458893511602286 | 1.053 |  |  |
| 3.462035104255876 | 1.054 |  |  |
| 3.465176696909465 | 1.055 |  |  |
| 3.468318289563055 | 1.056 |  |  |
| 3.471459882216644 | 1.057 |  |  |
| 3.474601474870234 | 1.058 |  |  |
| 3.477743067523824 | 1.059 |  |  |
| 3.480884660177413 | 1.06 |  |  |
| 3.484026252831002 | 1.062 |  |  |
| 3.487167845484592 | 1.063 |  |  |
| 3.490309438138182 | 1.064 |  |  |
| 3.493451030791772 | 1.065 |  |  |
| 3.496592623445361 | 1.067 |  |  |
| 3.499734216098951 | 1.068 |  |  |
| 3.50287580875254 | 1.069 |  |  |
| 3.50601740140613 | 1.07 |  |  |
| 3.50915899405972 | 1.072 |  |  |
| 3.512300586713309 | 1.073 |  |  |
| 3.515442179366899 | 1.074 |  |  |
| 3.518583772020488 | 1.076 |  |  |
| 3.521725364674078 | 1.077 |  |  |
| 3.524866957327668 | 1.078 |  |  |
| 3.528008549981257 | 1.08 |  |  |
| 3.531150142634847 | 1.081 |  |  |
| 3.534291735288436 | 1.082 |  |  |
| 3.537433327942026 | 1.084 |  |  |
| 3.540574920595616 | 1.085 |  |  |
| 3.543716513249205 | 1.087 |  |  |
| 3.546858105902795 | 1.088 |  |  |
| 3.549999698556384 | 1.09 |  |  |
| 3.553141291209974 | 1.091 |  |  |
| 3.556282883863564 | 1.093 |  |  |
| 3.559424476517153 | 1.094 |  |  |
| 3.562566069170743 | 1.096 |  |  |
| 3.565707661824332 | 1.097 |  |  |
| 3.568849254477922 | 1.099 |  |  |
| 3.571990847131511 | 1.1 |  |  |
| 3.575132439785101 | 1.102 |  |  |
| 3.578274032438691 | 1.104 |  |  |
| 3.58141562509228 | 1.105 |  |  |
| 3.58455721774587 | 1.107 |  |  |
| 3.58769881039946 | 1.108 |  |  |
| 3.590840403053049 | 1.11 |  |  |
| 3.593981995706639 | 1.112 |  |  |
| 3.597123588360228 | 1.114 |  |  |
| 3.600265181013818 | 1.115 |  |  |
| 3.603406773667407 | 1.117 |  |  |
| 3.606548366320997 | 1.119 |  |  |
| 3.609689958974587 | 1.121 |  |  |
| 3.612831551628176 | 1.122 |  |  |
| 3.615973144281766 | 1.124 |  |  |
| 3.619114736935355 | 1.126 |  |  |
| 3.622256329588945 | 1.128 |  |  |
| 3.625397922242534 | 1.13 |  |  |
| 3.628539514896124 | 1.132 |  |  |
| 3.631681107549714 | 1.133 |  |  |
| 3.634822700203303 | 1.135 |  |  |
| 3.637964292856893 | 1.137 |  |  |
| 3.641105885510483 | 1.139 |  |  |
| 3.644247478164072 | 1.141 |  |  |
| 3.647389070817662 | 1.143 |  |  |
| 3.650530663471251 | 1.145 |  |  |
| 3.653672256124841 | 1.147 |  |  |
| 3.656813848778431 | 1.149 |  |  |
| 3.65995544143202 | 1.151 |  |  |
| 3.66309703408561 | 1.153 |  |  |
| 3.666238626739199 | 1.155 |  |  |
| 3.66938021939279 | 1.158 |  |  |
| 3.672521812046378 | 1.16 |  |  |
| 3.675663404699968 | 1.162 |  |  |
| 3.678804997353558 | 1.164 |  |  |
| 3.681946590007147 | 1.166 |  |  |
| 3.685088182660737 | 1.168 |  |  |
| 3.688229775314326 | 1.171 |  |  |
| 3.691371367967916 | 1.173 |  |  |
| 3.694512960621506 | 1.175 |  |  |
| 3.697654553275095 | 1.177 |  |  |
| 3.700796145928685 | 1.18 |  |  |
| 3.703937738582274 | 1.182 |  |  |
| 3.707079331235864 | 1.184 |  |  |
| 3.710220923889454 | 1.187 |  |  |
| 3.713362516543043 | 1.189 |  |  |
| 3.716504109196633 | 1.192 |  |  |
| 3.719645701850223 | 1.194 |  |  |
| 3.722787294503812 | 1.196 |  |  |
| 3.725928887157402 | 1.199 |  |  |
| 3.729070479810991 | 1.201 |  |  |
| 3.732212072464581 | 1.204 |  |  |
| 3.735353665118171 | 1.207 |  |  |
| 3.73849525777176 | 1.209 |  |  |
| 3.74163685042535 | 1.212 |  |  |
| 3.744778443078939 | 1.214 |  |  |
| 3.747920035732529 | 1.217 |  |  |
| 3.751061628386119 | 1.22 |  |  |
| 3.754203221039708 | 1.222 |  |  |
| 3.757344813693298 | 1.225 |  |  |
| 3.760486406346887 | 1.228 |  |  |
| 3.763627999000477 | 1.23 |  |  |
| 3.766769591654067 | 1.233 |  |  |
| 3.769911184307656 | 1.236 |  |  |
| 3.773052776961246 | 1.239 |  |  |
| 3.776194369614835 | 1.242 |  |  |
| 3.779335962268425 | 1.245 |  |  |
| 3.782477554922014 | 1.248 |  |  |
| 3.785619147575604 | 1.25 |  |  |
| 3.788760740229193 | 1.253 |  |  |
| 3.791902332882783 | 1.256 |  |  |
| 3.795043925536373 | 1.259 |  |  |
| 3.798185518189962 | 1.263 |  |  |
| 3.801327110843552 | 1.266 |  |  |
| 3.804468703497142 | 1.269 |  |  |
| 3.807610296150731 | 1.272 |  |  |
| 3.810751888804321 | 1.275 |  |  |
| 3.813893481457911 | 1.278 |  |  |
| 3.8170350741115 | 1.281 |  |  |
| 3.82017666676509 | 1.285 |  |  |
| 3.823318259418679 | 1.288 |  |  |
| 3.826459852072269 | 1.291 |  |  |
| 3.829601444725859 | 1.294 |  |  |
| 3.832743037379448 | 1.298 |  |  |
| 3.835884630033038 | 1.301 |  |  |
| 3.839026222686627 | 1.305 |  |  |
| 3.842167815340217 | 1.308 |  |  |
| 3.845309407993807 | 1.312 |  |  |
| 3.848451000647396 | 1.315 |  |  |
| 3.851592593300986 | 1.319 |  |  |
| 3.854734185954575 | 1.322 |  |  |
| 3.857875778608165 | 1.326 |  |  |
| 3.861017371261755 | 1.329 |  |  |
| 3.864158963915344 | 1.333 |  |  |
| 3.867300556568933 | 1.337 |  |  |
| 3.870442149222523 | 1.341 |  |  |
| 3.873583741876112 | 1.344 |  |  |
| 3.876725334529703 | 1.348 |  |  |
| 3.879866927183292 | 1.352 |  |  |
| 3.883008519836882 | 1.356 |  |  |
| 3.886150112490471 | 1.36 |  |  |
| 3.889291705144061 | 1.364 |  |  |
| 3.892433297797651 | 1.368 |  |  |
| 3.89557489045124 | 1.372 |  |  |
| 3.89871648310483 | 1.376 |  |  |
| 3.901858075758419 | 1.38 |  |  |
| 3.904999668412009 | 1.384 |  |  |
| 3.908141261065598 | 1.388 |  |  |
| 3.911282853719188 | 1.393 |  |  |
| 3.914424446372778 | 1.397 |  |  |
| 3.917566039026367 | 1.401 |  |  |
| 3.920707631679957 | 1.405 |  |  |
| 3.923849224333547 | 1.41 |  |  |
| 3.926990816987136 | 1.414 |  |  |
| 3.930132409640726 | 1.419 |  |  |
| 3.933274002294315 | 1.423 |  |  |
| 3.936415594947905 | 1.428 |  |  |
| 3.939557187601495 | 1.432 |  |  |
| 3.942698780255084 | 1.437 |  |  |
| 3.945840372908674 | 1.442 |  |  |
| 3.948981965562263 | 1.446 |  |  |
| 3.952123558215853 | 1.451 |  |  |
| 3.955265150869442 | 1.456 |  |  |
| 3.958406743523032 | 1.461 |  |  |
| 3.961548336176622 | 1.466 |  |  |
| 3.964689928830211 | 1.471 |  |  |
| 3.967831521483801 | 1.476 |  |  |
| 3.97097311413739 | 1.481 |  |  |
| 3.97411470679098 | 1.486 |  |  |
| 3.97725629944457 | 1.491 |  |  |
| 3.98039789209816 | 1.496 |  |  |
| 3.983539484751749 | 1.501 |  |  |
| 3.986681077405338 | 1.507 |  |  |
| 3.989822670058928 | 1.512 |  |  |
| 3.992964262712517 | 1.518 |  |  |
| 3.996105855366107 | 1.523 |  |  |
| 3.999247448019697 | 1.529 |  |  |
| 4.002389040673287 | 1.534 |  |  |
| 4.005530633326877 | 1.54 |  |  |
| 4.008672225980466 | 1.545 |  |  |
| 4.011813818634056 | 1.551 |  |  |
| 4.014955411287645 | 1.557 |  |  |
| 4.018097003941234 | 1.563 |  |  |
| 4.021238596594824 | 1.569 |  |  |
| 4.024380189248414 | 1.575 |  |  |
| 4.027521781902004 | 1.581 |  |  |
| 4.030663374555593 | 1.587 |  |  |
| 4.033804967209183 | 1.593 |  |  |
| 4.036946559862773 | 1.599 |  |  |
| 4.040088152516362 | 1.606 |  |  |
| 4.043229745169951 | 1.612 |  |  |
| 4.046371337823541 | 1.618 |  |  |
| 4.049512930477131 | 1.625 |  |  |
| 4.05265452313072 | 1.632 |  |  |
| 4.05579611578431 | 1.638 |  |  |
| 4.0589377084379 | 1.645 |  |  |
| 4.062079301091489 | 1.652 |  |  |
| 4.065220893745079 | 1.659 |  |  |
| 4.068362486398668 | 1.666 |  |  |
| 4.071504079052258 | 1.673 |  |  |
| 4.074645671705848 | 1.68 |  |  |
| 4.077787264359437 | 1.687 |  |  |
| 4.080928857013027 | 1.694 |  |  |
| 4.084070449666616 | 1.701 |  |  |
| 4.087212042320206 | 1.709 |  |  |
| 4.090353634973795 | 1.716 |  |  |
| 4.093495227627385 | 1.724 |  |  |
| 4.096636820280975 | 1.731 |  |  |
| 4.099778412934564 | 1.739 |  |  |
| 4.102920005588154 | 1.747 |  |  |
| 4.106061598241744 | 1.755 |  |  |
| 4.109203190895333 | 1.763 |  |  |
| 4.112344783548923 | 1.771 |  |  |
| 4.115486376202512 | 1.779 |  |  |
| 4.118627968856102 | 1.787 |  |  |
| 4.121769561509692 | 1.796 |  |  |
| 4.124911154163281 | 1.804 |  |  |
| 4.128052746816871 | 1.813 |  |  |
| 4.13119433947046 | 1.821 |  |  |
| 4.13433593212405 | 1.83 |  |  |
| 4.13747752477764 | 1.839 |  |  |
| 4.14061911743123 | 1.848 |  |  |
| 4.143760710084818 | 1.857 |  |  |
| 4.146902302738408 | 1.866 |  |  |
| 4.150043895391998 | 1.876 |  |  |
| 4.153185488045588 | 1.885 |  |  |
| 4.156327080699177 | 1.894 |  |  |
| 4.159468673352766 | 1.904 |  |  |
| 4.162610266006356 | 1.914 |  |  |
| 4.165751858659946 | 1.924 |  |  |
| 4.168893451313535 | 1.934 |  |  |
| 4.172035043967125 | 1.944 |  |  |
| 4.175176636620715 | 1.954 |  |  |
| 4.178318229274304 | 1.964 |  |  |
| 4.181459821927894 | 1.975 |  |  |
| 4.184601414581484 | 1.986 |  |  |
| 4.187743007235073 | 1.996 |  |  |
| 4.190884599888663 | 2.007 |  |  |
| 4.194026192542252 | 2.018 |  |  |
| 4.197167785195842 | 2.03 |  |  |
| 4.200309377849432 | 2.041 |  |  |
| 4.203450970503021 | 2.052 |  |  |
| 4.206592563156611 | 2.064 |  |  |
| 4.2097341558102 | 2.076 |  |  |
| 4.21287574846379 | 2.088 |  |  |
| 4.21601734111738 | 2.1 |  |  |
| 4.21915893377097 | 2.112 |  |  |
| 4.222300526424559 | 2.124 |  |  |
| 4.225442119078148 | 2.137 |  |  |
| 4.228583711731738 | 2.15 |  |  |
| 4.231725304385327 | 2.163 |  |  |
| 4.234866897038917 | 2.176 |  |  |
| 4.238008489692506 | 2.189 |  |  |
| 4.241150082346096 | 2.203 |  |  |
| 4.244291674999685 | 2.216 |  |  |
| 4.247433267653276 | 2.23 |  |  |
| 4.250574860306865 | 2.244 |  |  |
| 4.253716452960455 | 2.259 |  |  |
| 4.256858045614044 | 2.273 |  |  |
| 4.259999638267634 | 2.288 |  |  |
| 4.263141230921224 | 2.303 |  |  |
| 4.266282823574813 | 2.318 |  |  |
| 4.269424416228403 | 2.333 |  |  |
| 4.272566008881992 | 2.349 |  |  |
| 4.275707601535582 | 2.364 |  |  |
| 4.27884919418917 | 2.38 |  |  |
| 4.28199078684276 | 2.397 |  |  |
| 4.285132379496351 | 2.413 |  |  |
| 4.28827397214994 | 2.43 |  |  |
| 4.29141556480353 | 2.447 |  |  |
| 4.294557157457119 | 2.464 |  |  |
| 4.29769875011071 | 2.482 |  |  |
| 4.300840342764299 | 2.5 |  |  |
| 4.303981935417888 | 2.518 |  |  |
| 4.307123528071478 | 2.536 |  |  |
| 4.310265120725067 | 2.555 |  |  |
| 4.313406713378657 | 2.574 |  |  |
| 4.316548306032247 | 2.593 |  |  |
| 4.319689898685836 | 2.613 |  |  |
| 4.322831491339426 | 2.633 |  |  |
| 4.325973083993015 | 2.653 |  |  |
| 4.329114676646605 | 2.674 |  |  |
| 4.332256269300195 | 2.695 |  |  |
| 4.335397861953784 | 2.716 |  |  |
| 4.338539454607374 | 2.738 |  |  |
| 4.341681047260963 | 2.76 |  |  |
| 4.344822639914553 | 2.783 |  |  |
| 4.347964232568143 | 2.806 |  |  |
| 4.351105825221732 | 2.829 |  |  |
| 4.354247417875322 | 2.853 |  |  |
| 4.357389010528911 | 2.877 |  |  |
| 4.360530603182501 | 2.902 |  |  |
| 4.36367219583609 | 2.927 |  |  |
| 4.36681378848968 | 2.952 |  |  |
| 4.36995538114327 | 2.978 |  |  |
| 4.373096973796859 | 3.005 |  |  |
| 4.376238566450449 | 3.032 |  |  |
| 4.379380159104038 | 3.059 |  |  |
| 4.382521751757628 | 3.087 |  |  |
| 4.385663344411217 | 3.116 |  |  |
| 4.388804937064807 | 3.145 |  |  |
| 4.391946529718397 | 3.175 |  |  |
| 4.395088122371987 | 3.205 |  |  |
| 4.398229715025576 | 3.236 |  |  |
| 4.401371307679165 | 3.268 |  |  |
| 4.404512900332755 | 3.3 |  |  |
| 4.407654492986345 | 3.333 |  |  |
| 4.410796085639934 | 3.367 |  |  |
| 4.413937678293524 | 3.401 |  |  |
| 4.417079270947114 | 3.436 |  |  |
| 4.420220863600703 | 3.472 |  |  |
| 4.423362456254293 | 3.509 |  |  |
| 4.426504048907883 | 3.546 |  |  |
| 4.429645641561472 | 3.584 |  |  |
| 4.432787234215062 | 3.624 |  |  |
| 4.435928826868651 | 3.664 |  |  |
| 4.43907041952224 | 3.705 |  |  |
| 4.44221201217583 | 3.747 |  |  |
| 4.44535360482942 | 3.79 |  |  |
| 4.44849519748301 | 3.834 |  |  |
| 4.4516367901366 | 3.879 |  |  |
| 4.454778382790188 | 3.925 |  |  |
| 4.457919975443779 | 3.972 |  |  |
| 4.461061568097368 | 4.021 |  |  |
| 4.464203160750958 | 4.071 |  |  |
| 4.467344753404547 | 4.122 |  |  |
| 4.470486346058137 | 4.174 |  |  |
| 4.473627938711726 | 4.228 |  |  |
| 4.476769531365316 | 4.284 |  |  |
| 4.479911124018905 | 4.34 |  |  |
| 4.483052716672495 | 4.399 |  |  |
| 4.486194309326085 | 4.459 |  |  |
| 4.489335901979674 | 4.521 |  |  |
| 4.492477494633264 | 4.584 |  |  |
| 4.495619087286854 | 4.65 |  |  |
| 4.498760679940443 | 4.717 |  |  |
| 4.501902272594033 | 4.786 |  |  |
| 4.505043865247622 | 4.858 |  |  |
| 4.508185457901212 | 4.931 |  |  |
| 4.511327050554801 | 5.007 |  |  |
| 4.514468643208391 | 5.086 |  |  |
| 4.517610235861981 | 5.167 |  |  |
| 4.520751828515571 | 5.25 |  |  |
| 4.52389342116916 | 5.337 |  |  |
| 4.52703501382275 | 5.426 |  |  |
| 4.530176606476339 | 5.519 |  |  |
| 4.533318199129928 | 5.614 |  |  |
| 4.536459791783518 | 5.714 |  |  |
| 4.539601384437108 | 5.816 |  |  |
| 4.542742977090698 | 5.923 |  |  |
| 4.545884569744287 | 6.034 |  |  |
| 4.549026162397876 | 6.149 |  |  |
| 4.552167755051466 | 6.268 |  |  |
| 4.555309347705056 | 6.392 |  |  |
| 4.558450940358646 | 6.522 |  |  |
| 4.561592533012235 | 6.657 |  |  |
| 4.564734125665825 | 6.797 |  |  |
| 4.567875718319415 | 6.944 |  |  |
| 4.571017310973004 | 7.097 |  |  |
| 4.574158903626594 | 7.257 |  |  |
| 4.577300496280183 | 7.425 |  |  |
| 4.580442088933772 | 7.601 |  |  |
| 4.583583681587362 | 7.785 |  |  |
| 4.586725274240952 | 7.979 |  |  |
| 4.589866866894542 | 8.182 |  |  |
| 4.593008459548131 | 8.397 |  |  |
| 4.596150052201721 | 8.622 |  |  |
| 4.59929164485531 | 8.861 |  |  |
| 4.6024332375089 | 9.113 |  |  |
| 4.60557483016249 | 9.38 |  |  |
| 4.608716422816079 | 9.663 |  |  |
| 4.611858015469668 | 9.964 |  |  |
| 4.614999608123258 | 10.284 |  |  |
| 4.618141200776848 | 10.626 |  |  |
| 4.621282793430437 | 10.991 |  |  |
| 4.624424386084027 | 11.383 |  |  |
| 4.627565978737617 | 11.803 |  |  |
| 4.630707571391206 | 12.256 |  |  |
| 4.633849164044795 | 12.745 |  |  |
| 4.636990756698386 | 13.275 |  |  |
| 4.640132349351975 | 13.852 |  |  |
| 4.643273942005564 | 14.48 |  |  |
| 4.646415534659154 | 15.169 |  |  |
| 4.649557127312744 | 15.926 |  |  |
| 4.652698719966334 | 16.763 |  |  |
| 4.655840312619923 | 17.693 |  |  |
| 4.658981905273513 | 18.733 |  |  |
| 4.662123497927102 | 19.903 |  |  |
| 4.665265090580692 | 21.229 |  |  |
| 4.668406683234282 | 22.744 |  |  |
| 4.671548275887871 | 24.492 |  |  |
| 4.674689868541461 | 26.532 |  |  |
| 4.67783146119505 | 28.943 |  |  |
| 4.68097305384864 | 31.836 |  |  |
| 4.68411464650223 | 35.372 |  |  |
| 4.687256239155819 | 39.793 |  |  |
| 4.690397831809409 | 45.477 |  |  |
| 4.693539424462998 | 53.055 |  |  |
| 4.696681017116588 | 63.665 |  |  |
| 4.699822609770177 | 79.58 |  |  |
| 4.702964202423767 | 106.105 |  |  |
| 4.706105795077356 | 159.156 |  |  |
| 4.709247387730946 | 318.31 |  |  |
| 4.712388980384535 | 6500317522984.02 |  |  |
| 4.715530573038126 | 318.31 |  |  |
| 4.718672165691715 | 159.156 |  |  |
| 4.721813758345305 | 106.105 |  |  |
| 4.724955350998894 | 79.58 |  |  |
| 4.728096943652484 | 63.665 |  |  |
| 4.731238536306074 | 53.055 |  |  |
| 4.734380128959663 | 45.477 |  |  |
| 4.737521721613253 | 39.793 |  |  |
| 4.740663314266842 | 35.372 |  |  |
| 4.743804906920432 | 31.836 |  |  |
| 4.74694649957402 | 28.943 |  |  |
| 4.750088092227611 | 26.532 |  |  |
| 4.7532296848812 | 24.492 |  |  |
| 4.75637127753479 | 22.744 |  |  |
| 4.75951287018838 | 21.229 |  |  |
| 4.76265446284197 | 19.903 |  |  |
| 4.765796055495559 | 18.733 |  |  |
| 4.768937648149149 | 17.693 |  |  |
| 4.772079240802738 | 16.763 |  |  |
| 4.775220833456327 | 15.926 |  |  |
| 4.778362426109917 | 15.169 |  |  |
| 4.781504018763507 | 14.48 |  |  |
| 4.784645611417097 | 13.852 |  |  |
| 4.787787204070686 | 13.275 |  |  |
| 4.790928796724275 | 12.745 |  |  |
| 4.794070389377865 | 12.256 |  |  |
| 4.797211982031455 | 11.803 |  |  |
| 4.800353574685045 | 11.383 |  |  |
| 4.803495167338634 | 10.991 |  |  |
| 4.806636759992224 | 10.626 |  |  |
| 4.809778352645814 | 10.284 |  |  |
| 4.812919945299403 | 9.964 |  |  |
| 4.816061537952993 | 9.663 |  |  |
| 4.819203130606582 | 9.38 |  |  |
| 4.822344723260172 | 9.113 |  |  |
| 4.825486315913761 | 8.861 |  |  |
| 4.828627908567351 | 8.622 |  |  |
| 4.83176950122094 | 8.397 |  |  |
| 4.83491109387453 | 8.182 |  |  |
| 4.83805268652812 | 7.979 |  |  |
| 4.841194279181709 | 7.785 |  |  |
| 4.844335871835299 | 7.601 |  |  |
| 4.847477464488889 | 7.425 |  |  |
| 4.850619057142478 | 7.257 |  |  |
| 4.853760649796068 | 7.097 |  |  |
| 4.856902242449657 | 6.944 |  |  |
| 4.860043835103247 | 6.797 |  |  |
| 4.863185427756837 | 6.657 |  |  |
| 4.866327020410426 | 6.522 |  |  |
| 4.869468613064015 | 6.392 |  |  |
| 4.872610205717605 | 6.268 |  |  |
| 4.875751798371195 | 6.149 |  |  |
| 4.878893391024784 | 6.034 |  |  |
| 4.882034983678374 | 5.923 |  |  |
| 4.885176576331964 | 5.816 |  |  |
| 4.888318168985553 | 5.714 |  |  |
| 4.891459761639143 | 5.614 |  |  |
| 4.894601354292733 | 5.519 |  |  |
| 4.897742946946322 | 5.426 |  |  |
| 4.900884539599912 | 5.337 |  |  |
| 4.904026132253501 | 5.25 |  |  |
| 4.907167724907091 | 5.167 |  |  |
| 4.91030931756068 | 5.086 |  |  |
| 4.91345091021427 | 5.007 |  |  |
| 4.91659250286786 | 4.931 |  |  |
| 4.91973409552145 | 4.858 |  |  |
| 4.922875688175039 | 4.786 |  |  |
| 4.926017280828628 | 4.717 |  |  |
| 4.929158873482218 | 4.65 |  |  |
| 4.932300466135808 | 4.584 |  |  |
| 4.935442058789397 | 4.521 |  |  |
| 4.938583651442987 | 4.459 |  |  |
| 4.941725244096576 | 4.399 |  |  |
| 4.944866836750166 | 4.34 |  |  |
| 4.948008429403755 | 4.284 |  |  |
| 4.951150022057345 | 4.228 |  |  |
| 4.954291614710935 | 4.174 |  |  |
| 4.957433207364524 | 4.122 |  |  |
| 4.960574800018114 | 4.071 |  |  |
| 4.963716392671704 | 4.021 |  |  |
| 4.966857985325293 | 3.972 |  |  |
| 4.969999577978883 | 3.925 |  |  |
| 4.973141170632472 | 3.879 |  |  |
| 4.976282763286062 | 3.834 |  |  |
| 4.979424355939651 | 3.79 |  |  |
| 4.982565948593241 | 3.747 |  |  |
| 4.985707541246831 | 3.705 |  |  |
| 4.98884913390042 | 3.664 |  |  |
| 4.99199072655401 | 3.624 |  |  |
| 4.9951323192076 | 3.584 |  |  |
| 4.99827391186119 | 3.546 |  |  |
| 5.00141550451478 | 3.509 |  |  |
| 5.004557097168369 | 3.472 |  |  |
| 5.007698689821958 | 3.436 |  |  |
| 5.010840282475548 | 3.401 |  |  |
| 5.013981875129137 | 3.367 |  |  |
| 5.017123467782727 | 3.333 |  |  |
| 5.020265060436317 | 3.3 |  |  |
| 5.023406653089906 | 3.268 |  |  |
| 5.026548245743496 | 3.236 |  |  |
| 5.029689838397085 | 3.205 |  |  |
| 5.032831431050674 | 3.175 |  |  |
| 5.035973023704264 | 3.145 |  |  |
| 5.039114616357854 | 3.116 |  |  |
| 5.042256209011444 | 3.087 |  |  |
| 5.045397801665033 | 3.059 |  |  |
| 5.048539394318622 | 3.032 |  |  |
| 5.051680986972213 | 3.005 |  |  |
| 5.054822579625802 | 2.978 |  |  |
| 5.057964172279392 | 2.952 |  |  |
| 5.061105764932981 | 2.927 |  |  |
| 5.064247357586571 | 2.902 |  |  |
| 5.067388950240161 | 2.877 |  |  |
| 5.07053054289375 | 2.853 |  |  |
| 5.07367213554734 | 2.829 |  |  |
| 5.07681372820093 | 2.806 |  |  |
| 5.079955320854519 | 2.783 |  |  |
| 5.083096913508108 | 2.76 |  |  |
| 5.086238506161698 | 2.738 |  |  |
| 5.089380098815288 | 2.716 |  |  |
| 5.092521691468877 | 2.695 |  |  |
| 5.095663284122466 | 2.674 |  |  |
| 5.098804876776057 | 2.653 |  |  |
| 5.101946469429646 | 2.633 |  |  |
| 5.105088062083236 | 2.613 |  |  |
| 5.108229654736825 | 2.593 |  |  |
| 5.111371247390415 | 2.574 |  |  |
| 5.114512840044005 | 2.555 |  |  |
| 5.117654432697594 | 2.536 |  |  |
| 5.120796025351184 | 2.518 |  |  |
| 5.123937618004773 | 2.5 |  |  |
| 5.127079210658363 | 2.482 |  |  |
| 5.130220803311953 | 2.464 |  |  |
| 5.133362395965542 | 2.447 |  |  |
| 5.136503988619131 | 2.43 |  |  |
| 5.13964558127272 | 2.413 |  |  |
| 5.142787173926311 | 2.397 |  |  |
| 5.1459287665799 | 2.38 |  |  |
| 5.14907035923349 | 2.364 |  |  |
| 5.15221195188708 | 2.349 |  |  |
| 5.15535354454067 | 2.333 |  |  |
| 5.158495137194259 | 2.318 |  |  |
| 5.161636729847848 | 2.303 |  |  |
| 5.164778322501438 | 2.288 |  |  |
| 5.167919915155028 | 2.273 |  |  |
| 5.171061507808617 | 2.259 |  |  |
| 5.174203100462206 | 2.244 |  |  |
| 5.177344693115796 | 2.23 |  |  |
| 5.180486285769386 | 2.216 |  |  |
| 5.183627878422976 | 2.203 |  |  |
| 5.186769471076565 | 2.189 |  |  |
| 5.189911063730155 | 2.176 |  |  |
| 5.193052656383744 | 2.163 |  |  |
| 5.196194249037334 | 2.15 |  |  |
| 5.199335841690924 | 2.137 |  |  |
| 5.202477434344513 | 2.124 |  |  |
| 5.205619026998103 | 2.112 |  |  |
| 5.208760619651692 | 2.1 |  |  |
| 5.211902212305282 | 2.088 |  |  |
| 5.215043804958871 | 2.076 |  |  |
| 5.218185397612461 | 2.064 |  |  |
| 5.221326990266051 | 2.052 |  |  |
| 5.22446858291964 | 2.041 |  |  |
| 5.22761017557323 | 2.03 |  |  |
| 5.23075176822682 | 2.018 |  |  |
| 5.23389336088041 | 2.007 |  |  |
| 5.237034953533999 | 1.996 |  |  |
| 5.240176546187588 | 1.986 |  |  |
| 5.243318138841178 | 1.975 |  |  |
| 5.246459731494767 | 1.964 |  |  |
| 5.249601324148357 | 1.954 |  |  |
| 5.252742916801947 | 1.944 |  |  |
| 5.255884509455536 | 1.934 |  |  |
| 5.259026102109125 | 1.924 |  |  |
| 5.262167694762715 | 1.914 |  |  |
| 5.265309287416305 | 1.904 |  |  |
| 5.268450880069895 | 1.894 |  |  |
| 5.271592472723484 | 1.885 |  |  |
| 5.274734065377074 | 1.876 |  |  |
| 5.277875658030664 | 1.866 |  |  |
| 5.281017250684253 | 1.857 |  |  |
| 5.284158843337843 | 1.848 |  |  |
| 5.287300435991432 | 1.839 |  |  |
| 5.290442028645022 | 1.83 |  |  |
| 5.293583621298612 | 1.821 |  |  |
| 5.296725213952201 | 1.813 |  |  |
| 5.299866806605791 | 1.804 |  |  |
| 5.30300839925938 | 1.796 |  |  |
| 5.30614999191297 | 1.787 |  |  |
| 5.30929158456656 | 1.779 |  |  |
| 5.312433177220149 | 1.771 |  |  |
| 5.315574769873739 | 1.763 |  |  |
| 5.318716362527328 | 1.755 |  |  |
| 5.321857955180918 | 1.747 |  |  |
| 5.324999547834508 | 1.739 |  |  |
| 5.328141140488097 | 1.731 |  |  |
| 5.331282733141686 | 1.724 |  |  |
| 5.334424325795276 | 1.716 |  |  |
| 5.337565918448866 | 1.709 |  |  |
| 5.340707511102456 | 1.701 |  |  |
| 5.343849103756045 | 1.694 |  |  |
| 5.346990696409634 | 1.687 |  |  |
| 5.350132289063224 | 1.68 |  |  |
| 5.353273881716814 | 1.673 |  |  |
| 5.356415474370403 | 1.666 |  |  |
| 5.359557067023993 | 1.659 |  |  |
| 5.362698659677583 | 1.652 |  |  |
| 5.365840252331172 | 1.645 |  |  |
| 5.368981844984762 | 1.638 |  |  |
| 5.372123437638351 | 1.632 |  |  |
| 5.375265030291941 | 1.625 |  |  |
| 5.378406622945531 | 1.618 |  |  |
| 5.38154821559912 | 1.612 |  |  |
| 5.38468980825271 | 1.606 |  |  |
| 5.387831400906299 | 1.599 |  |  |
| 5.39097299355989 | 1.593 |  |  |
| 5.394114586213479 | 1.587 |  |  |
| 5.397256178867068 | 1.581 |  |  |
| 5.400397771520657 | 1.575 |  |  |
| 5.403539364174247 | 1.569 |  |  |
| 5.406680956827837 | 1.563 |  |  |
| 5.409822549481426 | 1.557 |  |  |
| 5.412964142135016 | 1.551 |  |  |
| 5.416105734788605 | 1.545 |  |  |
| 5.419247327442195 | 1.54 |  |  |
| 5.422388920095785 | 1.534 |  |  |
| 5.425530512749375 | 1.529 |  |  |
| 5.428672105402964 | 1.523 |  |  |
| 5.431813698056554 | 1.518 |  |  |
| 5.434955290710143 | 1.512 |  |  |
| 5.438096883363733 | 1.507 |  |  |
| 5.441238476017322 | 1.501 |  |  |
| 5.444380068670912 | 1.496 |  |  |
| 5.447521661324502 | 1.491 |  |  |
| 5.450663253978091 | 1.486 |  |  |
| 5.453804846631681 | 1.481 |  |  |
| 5.456946439285271 | 1.476 |  |  |
| 5.46008803193886 | 1.471 |  |  |
| 5.46322962459245 | 1.466 |  |  |
| 5.466371217246039 | 1.461 |  |  |
| 5.46951280989963 | 1.456 |  |  |
| 5.472654402553218 | 1.451 |  |  |
| 5.475795995206808 | 1.446 |  |  |
| 5.478937587860398 | 1.442 |  |  |
| 5.482079180513987 | 1.437 |  |  |
| 5.485220773167577 | 1.432 |  |  |
| 5.488362365821166 | 1.428 |  |  |
| 5.491503958474756 | 1.423 |  |  |
| 5.494645551128346 | 1.419 |  |  |
| 5.497787143781935 | 1.414 |  |  |
| 5.500928736435525 | 1.41 |  |  |
| 5.504070329089115 | 1.405 |  |  |
| 5.507211921742704 | 1.401 |  |  |
| 5.510353514396294 | 1.397 |  |  |
| 5.513495107049883 | 1.393 |  |  |
| 5.516636699703473 | 1.388 |  |  |
| 5.519778292357062 | 1.384 |  |  |
| 5.522919885010652 | 1.38 |  |  |
| 5.526061477664242 | 1.376 |  |  |
| 5.529203070317831 | 1.372 |  |  |
| 5.532344662971421 | 1.368 |  |  |
| 5.535486255625011 | 1.364 |  |  |
| 5.5386278482786 | 1.36 |  |  |
| 5.54176944093219 | 1.356 |  |  |
| 5.544911033585779 | 1.352 |  |  |
| 5.54805262623937 | 1.348 |  |  |
| 5.551194218892959 | 1.344 |  |  |
| 5.554335811546548 | 1.341 |  |  |
| 5.557477404200137 | 1.337 |  |  |
| 5.560618996853727 | 1.333 |  |  |
| 5.563760589507317 | 1.329 |  |  |
| 5.566902182160906 | 1.326 |  |  |
| 5.570043774814496 | 1.322 |  |  |
| 5.573185367468086 | 1.319 |  |  |
| 5.576326960121675 | 1.315 |  |  |
| 5.579468552775264 | 1.312 |  |  |
| 5.582610145428854 | 1.308 |  |  |
| 5.585751738082444 | 1.305 |  |  |
| 5.588893330736034 | 1.301 |  |  |
| 5.592034923389623 | 1.298 |  |  |
| 5.595176516043213 | 1.294 |  |  |
| 5.598318108696803 | 1.291 |  |  |
| 5.601459701350392 | 1.288 |  |  |
| 5.604601294003982 | 1.285 |  |  |
| 5.607742886657571 | 1.281 |  |  |
| 5.610884479311161 | 1.278 |  |  |
| 5.61402607196475 | 1.275 |  |  |
| 5.61716766461834 | 1.272 |  |  |
| 5.62030925727193 | 1.269 |  |  |
| 5.623450849925519 | 1.266 |  |  |
| 5.626592442579109 | 1.263 |  |  |
| 5.629734035232698 | 1.259 |  |  |
| 5.632875627886288 | 1.256 |  |  |
| 5.636017220539878 | 1.253 |  |  |
| 5.639158813193467 | 1.25 |  |  |
| 5.642300405847057 | 1.248 |  |  |
| 5.645441998500646 | 1.245 |  |  |
| 5.648583591154236 | 1.242 |  |  |
| 5.651725183807825 | 1.239 |  |  |
| 5.654866776461415 | 1.236 |  |  |
| 5.658008369115005 | 1.233 |  |  |
| 5.661149961768594 | 1.23 |  |  |
| 5.664291554422184 | 1.228 |  |  |
| 5.667433147075774 | 1.225 |  |  |
| 5.670574739729363 | 1.222 |  |  |
| 5.673716332382953 | 1.22 |  |  |
| 5.676857925036542 | 1.217 |  |  |
| 5.679999517690132 | 1.214 |  |  |
| 5.683141110343721 | 1.212 |  |  |
| 5.686282702997311 | 1.209 |  |  |
| 5.689424295650901 | 1.207 |  |  |
| 5.69256588830449 | 1.204 |  |  |
| 5.69570748095808 | 1.201 |  |  |
| 5.69884907361167 | 1.199 |  |  |
| 5.701990666265259 | 1.196 |  |  |
| 5.705132258918849 | 1.194 |  |  |
| 5.708273851572438 | 1.192 |  |  |
| 5.711415444226028 | 1.189 |  |  |
| 5.714557036879618 | 1.187 |  |  |
| 5.717698629533207 | 1.184 |  |  |
| 5.720840222186797 | 1.182 |  |  |
| 5.723981814840386 | 1.18 |  |  |
| 5.727123407493976 | 1.177 |  |  |
| 5.730265000147565 | 1.175 |  |  |
| 5.733406592801155 | 1.173 |  |  |
| 5.736548185454744 | 1.171 |  |  |
| 5.739689778108334 | 1.168 |  |  |
| 5.742831370761924 | 1.166 |  |  |
| 5.745972963415514 | 1.164 |  |  |
| 5.749114556069103 | 1.162 |  |  |
| 5.752256148722693 | 1.16 |  |  |
| 5.755397741376282 | 1.158 |  |  |
| 5.758539334029872 | 1.155 |  |  |
| 5.761680926683462 | 1.153 |  |  |
| 5.764822519337051 | 1.151 |  |  |
| 5.767964111990641 | 1.149 |  |  |
| 5.77110570464423 | 1.147 |  |  |
| 5.77424729729782 | 1.145 |  |  |
| 5.77738888995141 | 1.143 |  |  |
| 5.780530482605 | 1.141 |  |  |
| 5.783672075258588 | 1.139 |  |  |
| 5.786813667912178 | 1.137 |  |  |
| 5.789955260565768 | 1.135 |  |  |
| 5.793096853219358 | 1.133 |  |  |
| 5.796238445872947 | 1.132 |  |  |
| 5.799380038526537 | 1.13 |  |  |
| 5.802521631180126 | 1.128 |  |  |
| 5.805663223833715 | 1.126 |  |  |
| 5.808804816487306 | 1.124 |  |  |
| 5.811946409140895 | 1.122 |  |  |
| 5.815088001794485 | 1.121 |  |  |
| 5.818229594448074 | 1.119 |  |  |
| 5.821371187101663 | 1.117 |  |  |
| 5.824512779755254 | 1.115 |  |  |
| 5.827654372408843 | 1.114 |  |  |
| 5.830795965062433 | 1.112 |  |  |
| 5.833937557716022 | 1.11 |  |  |
| 5.837079150369612 | 1.108 |  |  |
| 5.840220743023201 | 1.107 |  |  |
| 5.843362335676791 | 1.105 |  |  |
| 5.846503928330381 | 1.104 |  |  |
| 5.84964552098397 | 1.102 |  |  |
| 5.85278711363756 | 1.1 |  |  |
| 5.85592870629115 | 1.099 |  |  |
| 5.85907029894474 | 1.097 |  |  |
| 5.862211891598329 | 1.096 |  |  |
| 5.865353484251918 | 1.094 |  |  |
| 5.868495076905508 | 1.093 |  |  |
| 5.871636669559098 | 1.091 |  |  |
| 5.874778262212687 | 1.09 |  |  |
| 5.877919854866277 | 1.088 |  |  |
| 5.881061447519866 | 1.087 |  |  |
| 5.884203040173456 | 1.085 |  |  |
| 5.887344632827046 | 1.084 |  |  |
| 5.890486225480635 | 1.082 |  |  |
| 5.893627818134224 | 1.081 |  |  |
| 5.896769410787814 | 1.08 |  |  |
| 5.899911003441404 | 1.078 |  |  |
| 5.903052596094994 | 1.077 |  |  |
| 5.906194188748583 | 1.076 |  |  |
| 5.909335781402172 | 1.074 |  |  |
| 5.912477374055762 | 1.073 |  |  |
| 5.915618966709352 | 1.072 |  |  |
| 5.918760559362942 | 1.07 |  |  |
| 5.921902152016531 | 1.069 |  |  |
| 5.92504374467012 | 1.068 |  |  |
| 5.92818533732371 | 1.067 |  |  |
| 5.9313269299773 | 1.065 |  |  |
| 5.93446852263089 | 1.064 |  |  |
| 5.93761011528448 | 1.063 |  |  |
| 5.940751707938068 | 1.062 |  |  |
| 5.943893300591658 | 1.06 |  |  |
| 5.947034893245248 | 1.059 |  |  |
| 5.950176485898837 | 1.058 |  |  |
| 5.953318078552427 | 1.057 |  |  |
| 5.956459671206017 | 1.056 |  |  |
| 5.959601263859606 | 1.055 |  |  |
| 5.962742856513196 | 1.054 |  |  |
| 5.965884449166785 | 1.053 |  |  |
| 5.969026041820375 | 1.051 |  |  |
| 5.972167634473964 | 1.05 |  |  |
| 5.975309227127554 | 1.049 |  |  |
| 5.978450819781144 | 1.048 |  |  |
| 5.981592412434733 | 1.047 |  |  |
| 5.984734005088323 | 1.046 |  |  |
| 5.987875597741913 | 1.045 |  |  |
| 5.991017190395502 | 1.044 |  |  |
| 5.994158783049092 | 1.043 |  |  |
| 5.997300375702681 | 1.042 |  |  |
| 6.000441968356271 | 1.041 |  |  |
| 6.003583561009861 | 1.04 |  |  |
| 6.00672515366345 | 1.039 |  |  |
| 6.00986674631704 | 1.039 |  |  |
| 6.01300833897063 | 1.038 |  |  |
| 6.01614993162422 | 1.037 |  |  |
| 6.019291524277808 | 1.036 |  |  |
| 6.022433116931398 | 1.035 |  |  |
| 6.025574709584988 | 1.034 |  |  |
| 6.028716302238577 | 1.033 |  |  |
| 6.031857894892167 | 1.032 |  |  |
| 6.034999487545757 | 1.032 |  |  |
| 6.038141080199346 | 1.031 |  |  |
| 6.041282672852935 | 1.03 |  |  |
| 6.044424265506525 | 1.029 |  |  |
| 6.047565858160115 | 1.028 |  |  |
| 6.050707450813704 | 1.028 |  |  |
| 6.053849043467294 | 1.027 |  |  |
| 6.056990636120884 | 1.026 |  |  |
| 6.060132228774473 | 1.025 |  |  |
| 6.063273821428063 | 1.025 |  |  |
| 6.066415414081653 | 1.024 |  |  |
| 6.069557006735242 | 1.023 |  |  |
| 6.072698599388831 | 1.023 |  |  |
| 6.07584019204242 | 1.022 |  |  |
| 6.078981784696011 | 1.021 |  |  |
| 6.082123377349601 | 1.021 |  |  |
| 6.08526497000319 | 1.02 |  |  |
| 6.08840656265678 | 1.019 |  |  |
| 6.09154815531037 | 1.019 |  |  |
| 6.094689747963959 | 1.018 |  |  |
| 6.097831340617549 | 1.017 |  |  |
| 6.100972933271138 | 1.017 |  |  |
| 6.104114525924728 | 1.016 |  |  |
| 6.107256118578317 | 1.016 |  |  |
| 6.110397711231907 | 1.015 |  |  |
| 6.113539303885497 | 1.015 |  |  |
| 6.116680896539086 | 1.014 |  |  |
| 6.119822489192675 | 1.013 |  |  |
| 6.122964081846265 | 1.013 |  |  |
| 6.126105674499855 | 1.012 |  |  |
| 6.129247267153445 | 1.012 |  |  |
| 6.132388859807034 | 1.011 |  |  |
| 6.135530452460624 | 1.011 |  |  |
| 6.138672045114213 | 1.011 |  |  |
| 6.141813637767803 | 1.01 |  |  |
| 6.144955230421393 | 1.01 |  |  |
| 6.148096823074982 | 1.009 |  |  |
| 6.151238415728571 | 1.009 |  |  |
| 6.154380008382161 | 1.008 |  |  |
| 6.157521601035751 | 1.008 |  |  |
| 6.16066319368934 | 1.008 |  |  |
| 6.16380478634293 | 1.007 |  |  |
| 6.16694637899652 | 1.007 |  |  |
| 6.170087971650109 | 1.006 |  |  |
| 6.173229564303698 | 1.006 |  |  |
| 6.176371156957289 | 1.006 |  |  |
| 6.179512749610878 | 1.005 |  |  |
| 6.182654342264468 | 1.005 |  |  |
| 6.185795934918057 | 1.005 |  |  |
| 6.188937527571647 | 1.004 |  |  |
| 6.192079120225237 | 1.004 |  |  |
| 6.195220712878826 | 1.004 |  |  |
| 6.198362305532415 | 1.004 |  |  |
| 6.201503898186005 | 1.003 |  |  |
| 6.204645490839594 | 1.003 |  |  |
| 6.207787083493184 | 1.003 |  |  |
| 6.210928676146774 | 1.003 |  |  |
| 6.214070268800364 | 1.002 |  |  |
| 6.217211861453953 | 1.002 |  |  |
| 6.220353454107543 | 1.002 |  |  |
| 6.223495046761133 | 1.002 |  |  |
| 6.226636639414722 | 1.002 |  |  |
| 6.229778232068312 | 1.001 |  |  |
| 6.232919824721901 | 1.001 |  |  |
| 6.236061417375491 | 1.001 |  |  |
| 6.23920301002908 | 1.001 |  |  |
| 6.24234460268267 | 1.001 |  |  |
| 6.24548619533626 | 1.001 |  |  |
| 6.24862778798985 | 1.001 |  |  |
| 6.251769380643438 | 1 |  |  |
| 6.254910973297028 | 1 |  |  |
| 6.258052565950618 | 1 |  |  |
| 6.261194158604208 | 1 |  |  |
| 6.264335751257797 | 1 |  |  |
| 6.267477343911387 | 1 |  |  |
| 6.270618936564976 | 1 |  |  |
| 6.273760529218566 | 1 |  |  |
| 6.276902121872155 | 1 |  |  |
| 6.280043714525745 | 1 |  |  |
| 6.283185307179335 | 1 |  |  |